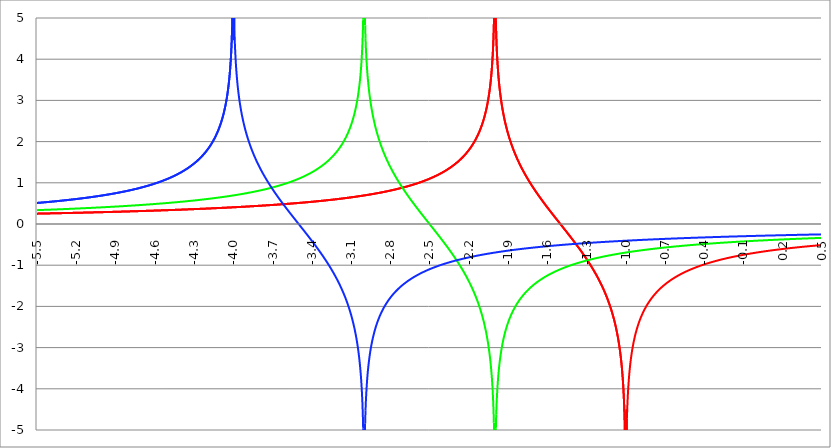
| Category | Series 1 | Series 0 | Series 2 |
|---|---|---|---|
| -5.5 | 0.251 | 0.336 | 0.511 |
| -5.497 | 0.252 | 0.337 | 0.512 |
| -5.494 | 0.252 | 0.337 | 0.512 |
| -5.491 | 0.252 | 0.338 | 0.513 |
| -5.488 | 0.252 | 0.338 | 0.514 |
| -5.484999999999999 | 0.252 | 0.338 | 0.515 |
| -5.482 | 0.252 | 0.339 | 0.516 |
| -5.479 | 0.253 | 0.339 | 0.516 |
| -5.476 | 0.253 | 0.339 | 0.517 |
| -5.472999999999999 | 0.253 | 0.34 | 0.518 |
| -5.469999999999999 | 0.253 | 0.34 | 0.519 |
| -5.466999999999999 | 0.253 | 0.34 | 0.52 |
| -5.463999999999999 | 0.254 | 0.341 | 0.521 |
| -5.460999999999998 | 0.254 | 0.341 | 0.521 |
| -5.457999999999998 | 0.254 | 0.341 | 0.522 |
| -5.454999999999998 | 0.254 | 0.342 | 0.523 |
| -5.451999999999998 | 0.254 | 0.342 | 0.524 |
| -5.448999999999998 | 0.255 | 0.342 | 0.525 |
| -5.445999999999998 | 0.255 | 0.343 | 0.526 |
| -5.442999999999998 | 0.255 | 0.343 | 0.527 |
| -5.439999999999997 | 0.255 | 0.343 | 0.527 |
| -5.436999999999997 | 0.255 | 0.344 | 0.528 |
| -5.433999999999997 | 0.256 | 0.344 | 0.529 |
| -5.430999999999997 | 0.256 | 0.345 | 0.53 |
| -5.427999999999997 | 0.256 | 0.345 | 0.531 |
| -5.424999999999997 | 0.256 | 0.345 | 0.532 |
| -5.421999999999997 | 0.256 | 0.346 | 0.533 |
| -5.418999999999997 | 0.257 | 0.346 | 0.533 |
| -5.415999999999997 | 0.257 | 0.346 | 0.534 |
| -5.412999999999997 | 0.257 | 0.347 | 0.535 |
| -5.409999999999996 | 0.257 | 0.347 | 0.536 |
| -5.406999999999996 | 0.257 | 0.347 | 0.537 |
| -5.403999999999996 | 0.258 | 0.348 | 0.538 |
| -5.400999999999996 | 0.258 | 0.348 | 0.539 |
| -5.397999999999996 | 0.258 | 0.349 | 0.54 |
| -5.394999999999996 | 0.258 | 0.349 | 0.54 |
| -5.391999999999996 | 0.258 | 0.349 | 0.541 |
| -5.388999999999996 | 0.259 | 0.35 | 0.542 |
| -5.385999999999996 | 0.259 | 0.35 | 0.543 |
| -5.382999999999996 | 0.259 | 0.35 | 0.544 |
| -5.379999999999995 | 0.259 | 0.351 | 0.545 |
| -5.376999999999995 | 0.259 | 0.351 | 0.546 |
| -5.373999999999995 | 0.26 | 0.352 | 0.547 |
| -5.370999999999995 | 0.26 | 0.352 | 0.548 |
| -5.367999999999995 | 0.26 | 0.352 | 0.549 |
| -5.364999999999995 | 0.26 | 0.353 | 0.55 |
| -5.361999999999995 | 0.26 | 0.353 | 0.551 |
| -5.358999999999995 | 0.261 | 0.353 | 0.551 |
| -5.355999999999994 | 0.261 | 0.354 | 0.552 |
| -5.352999999999994 | 0.261 | 0.354 | 0.553 |
| -5.349999999999994 | 0.261 | 0.355 | 0.554 |
| -5.346999999999994 | 0.261 | 0.355 | 0.555 |
| -5.343999999999994 | 0.262 | 0.355 | 0.556 |
| -5.340999999999994 | 0.262 | 0.356 | 0.557 |
| -5.337999999999994 | 0.262 | 0.356 | 0.558 |
| -5.334999999999994 | 0.262 | 0.356 | 0.559 |
| -5.331999999999994 | 0.262 | 0.357 | 0.56 |
| -5.328999999999993 | 0.263 | 0.357 | 0.561 |
| -5.325999999999993 | 0.263 | 0.358 | 0.562 |
| -5.322999999999993 | 0.263 | 0.358 | 0.563 |
| -5.319999999999993 | 0.263 | 0.358 | 0.564 |
| -5.316999999999993 | 0.263 | 0.359 | 0.565 |
| -5.313999999999993 | 0.264 | 0.359 | 0.566 |
| -5.310999999999993 | 0.264 | 0.36 | 0.567 |
| -5.307999999999993 | 0.264 | 0.36 | 0.568 |
| -5.304999999999993 | 0.264 | 0.36 | 0.569 |
| -5.301999999999992 | 0.265 | 0.361 | 0.57 |
| -5.298999999999992 | 0.265 | 0.361 | 0.571 |
| -5.295999999999992 | 0.265 | 0.362 | 0.572 |
| -5.292999999999992 | 0.265 | 0.362 | 0.573 |
| -5.289999999999992 | 0.265 | 0.362 | 0.574 |
| -5.286999999999992 | 0.266 | 0.363 | 0.575 |
| -5.283999999999992 | 0.266 | 0.363 | 0.576 |
| -5.280999999999992 | 0.266 | 0.364 | 0.577 |
| -5.277999999999992 | 0.266 | 0.364 | 0.578 |
| -5.274999999999991 | 0.266 | 0.364 | 0.579 |
| -5.271999999999991 | 0.267 | 0.365 | 0.58 |
| -5.268999999999991 | 0.267 | 0.365 | 0.581 |
| -5.265999999999991 | 0.267 | 0.366 | 0.582 |
| -5.262999999999991 | 0.267 | 0.366 | 0.583 |
| -5.259999999999991 | 0.268 | 0.366 | 0.584 |
| -5.256999999999991 | 0.268 | 0.367 | 0.585 |
| -5.253999999999991 | 0.268 | 0.367 | 0.586 |
| -5.250999999999991 | 0.268 | 0.368 | 0.587 |
| -5.24799999999999 | 0.268 | 0.368 | 0.588 |
| -5.24499999999999 | 0.269 | 0.368 | 0.59 |
| -5.24199999999999 | 0.269 | 0.369 | 0.591 |
| -5.23899999999999 | 0.269 | 0.369 | 0.592 |
| -5.23599999999999 | 0.269 | 0.37 | 0.593 |
| -5.23299999999999 | 0.27 | 0.37 | 0.594 |
| -5.22999999999999 | 0.27 | 0.37 | 0.595 |
| -5.22699999999999 | 0.27 | 0.371 | 0.596 |
| -5.22399999999999 | 0.27 | 0.371 | 0.597 |
| -5.220999999999989 | 0.27 | 0.372 | 0.598 |
| -5.217999999999989 | 0.271 | 0.372 | 0.599 |
| -5.214999999999989 | 0.271 | 0.373 | 0.601 |
| -5.21199999999999 | 0.271 | 0.373 | 0.602 |
| -5.208999999999989 | 0.271 | 0.373 | 0.603 |
| -5.205999999999989 | 0.271 | 0.374 | 0.604 |
| -5.202999999999989 | 0.272 | 0.374 | 0.605 |
| -5.199999999999989 | 0.272 | 0.375 | 0.606 |
| -5.196999999999988 | 0.272 | 0.375 | 0.607 |
| -5.193999999999988 | 0.272 | 0.376 | 0.608 |
| -5.190999999999988 | 0.273 | 0.376 | 0.61 |
| -5.187999999999988 | 0.273 | 0.376 | 0.611 |
| -5.184999999999988 | 0.273 | 0.377 | 0.612 |
| -5.181999999999988 | 0.273 | 0.377 | 0.613 |
| -5.178999999999988 | 0.274 | 0.378 | 0.614 |
| -5.175999999999988 | 0.274 | 0.378 | 0.615 |
| -5.172999999999988 | 0.274 | 0.379 | 0.617 |
| -5.169999999999987 | 0.274 | 0.379 | 0.618 |
| -5.166999999999987 | 0.274 | 0.379 | 0.619 |
| -5.163999999999987 | 0.275 | 0.38 | 0.62 |
| -5.160999999999987 | 0.275 | 0.38 | 0.621 |
| -5.157999999999987 | 0.275 | 0.381 | 0.622 |
| -5.154999999999987 | 0.275 | 0.381 | 0.624 |
| -5.151999999999987 | 0.276 | 0.382 | 0.625 |
| -5.148999999999987 | 0.276 | 0.382 | 0.626 |
| -5.145999999999987 | 0.276 | 0.383 | 0.627 |
| -5.142999999999986 | 0.276 | 0.383 | 0.629 |
| -5.139999999999986 | 0.276 | 0.383 | 0.63 |
| -5.136999999999986 | 0.277 | 0.384 | 0.631 |
| -5.133999999999986 | 0.277 | 0.384 | 0.632 |
| -5.130999999999986 | 0.277 | 0.385 | 0.633 |
| -5.127999999999986 | 0.277 | 0.385 | 0.635 |
| -5.124999999999986 | 0.278 | 0.386 | 0.636 |
| -5.121999999999986 | 0.278 | 0.386 | 0.637 |
| -5.118999999999986 | 0.278 | 0.387 | 0.639 |
| -5.115999999999985 | 0.278 | 0.387 | 0.64 |
| -5.112999999999985 | 0.279 | 0.387 | 0.641 |
| -5.109999999999985 | 0.279 | 0.388 | 0.642 |
| -5.106999999999985 | 0.279 | 0.388 | 0.644 |
| -5.103999999999985 | 0.279 | 0.389 | 0.645 |
| -5.100999999999985 | 0.28 | 0.389 | 0.646 |
| -5.097999999999985 | 0.28 | 0.39 | 0.647 |
| -5.094999999999985 | 0.28 | 0.39 | 0.649 |
| -5.091999999999984 | 0.28 | 0.391 | 0.65 |
| -5.088999999999984 | 0.28 | 0.391 | 0.651 |
| -5.085999999999984 | 0.281 | 0.392 | 0.653 |
| -5.082999999999984 | 0.281 | 0.392 | 0.654 |
| -5.079999999999984 | 0.281 | 0.393 | 0.655 |
| -5.076999999999984 | 0.281 | 0.393 | 0.657 |
| -5.073999999999984 | 0.282 | 0.394 | 0.658 |
| -5.070999999999984 | 0.282 | 0.394 | 0.659 |
| -5.067999999999984 | 0.282 | 0.394 | 0.661 |
| -5.064999999999984 | 0.282 | 0.395 | 0.662 |
| -5.061999999999983 | 0.283 | 0.395 | 0.664 |
| -5.058999999999983 | 0.283 | 0.396 | 0.665 |
| -5.055999999999983 | 0.283 | 0.396 | 0.666 |
| -5.052999999999983 | 0.283 | 0.397 | 0.668 |
| -5.049999999999983 | 0.284 | 0.397 | 0.669 |
| -5.046999999999983 | 0.284 | 0.398 | 0.67 |
| -5.043999999999983 | 0.284 | 0.398 | 0.672 |
| -5.040999999999983 | 0.284 | 0.399 | 0.673 |
| -5.037999999999982 | 0.285 | 0.399 | 0.675 |
| -5.034999999999982 | 0.285 | 0.4 | 0.676 |
| -5.031999999999982 | 0.285 | 0.4 | 0.678 |
| -5.028999999999982 | 0.285 | 0.401 | 0.679 |
| -5.025999999999982 | 0.286 | 0.401 | 0.68 |
| -5.022999999999982 | 0.286 | 0.402 | 0.682 |
| -5.019999999999982 | 0.286 | 0.402 | 0.683 |
| -5.016999999999982 | 0.286 | 0.403 | 0.685 |
| -5.013999999999982 | 0.287 | 0.403 | 0.686 |
| -5.010999999999981 | 0.287 | 0.404 | 0.688 |
| -5.007999999999981 | 0.287 | 0.404 | 0.689 |
| -5.004999999999981 | 0.287 | 0.405 | 0.691 |
| -5.001999999999981 | 0.288 | 0.405 | 0.692 |
| -4.998999999999981 | 0.288 | 0.406 | 0.694 |
| -4.995999999999981 | 0.288 | 0.406 | 0.695 |
| -4.992999999999981 | 0.288 | 0.407 | 0.697 |
| -4.98999999999998 | 0.289 | 0.407 | 0.698 |
| -4.98699999999998 | 0.289 | 0.408 | 0.7 |
| -4.98399999999998 | 0.289 | 0.408 | 0.701 |
| -4.98099999999998 | 0.289 | 0.409 | 0.703 |
| -4.97799999999998 | 0.29 | 0.409 | 0.704 |
| -4.97499999999998 | 0.29 | 0.41 | 0.706 |
| -4.97199999999998 | 0.29 | 0.41 | 0.707 |
| -4.96899999999998 | 0.29 | 0.411 | 0.709 |
| -4.96599999999998 | 0.291 | 0.411 | 0.711 |
| -4.96299999999998 | 0.291 | 0.412 | 0.712 |
| -4.95999999999998 | 0.291 | 0.412 | 0.714 |
| -4.95699999999998 | 0.291 | 0.413 | 0.715 |
| -4.95399999999998 | 0.292 | 0.413 | 0.717 |
| -4.95099999999998 | 0.292 | 0.414 | 0.719 |
| -4.94799999999998 | 0.292 | 0.414 | 0.72 |
| -4.944999999999979 | 0.292 | 0.415 | 0.722 |
| -4.941999999999978 | 0.293 | 0.415 | 0.723 |
| -4.938999999999978 | 0.293 | 0.416 | 0.725 |
| -4.935999999999978 | 0.293 | 0.416 | 0.727 |
| -4.932999999999978 | 0.293 | 0.417 | 0.728 |
| -4.929999999999978 | 0.294 | 0.417 | 0.73 |
| -4.926999999999978 | 0.294 | 0.418 | 0.732 |
| -4.923999999999978 | 0.294 | 0.419 | 0.733 |
| -4.920999999999978 | 0.294 | 0.419 | 0.735 |
| -4.917999999999978 | 0.295 | 0.42 | 0.737 |
| -4.914999999999978 | 0.295 | 0.42 | 0.739 |
| -4.911999999999977 | 0.295 | 0.421 | 0.74 |
| -4.908999999999977 | 0.295 | 0.421 | 0.742 |
| -4.905999999999977 | 0.296 | 0.422 | 0.744 |
| -4.902999999999977 | 0.296 | 0.422 | 0.745 |
| -4.899999999999977 | 0.296 | 0.423 | 0.747 |
| -4.896999999999977 | 0.297 | 0.423 | 0.749 |
| -4.893999999999977 | 0.297 | 0.424 | 0.751 |
| -4.890999999999977 | 0.297 | 0.424 | 0.753 |
| -4.887999999999977 | 0.297 | 0.425 | 0.754 |
| -4.884999999999977 | 0.298 | 0.426 | 0.756 |
| -4.881999999999976 | 0.298 | 0.426 | 0.758 |
| -4.878999999999976 | 0.298 | 0.427 | 0.76 |
| -4.875999999999976 | 0.298 | 0.427 | 0.762 |
| -4.872999999999976 | 0.299 | 0.428 | 0.763 |
| -4.869999999999976 | 0.299 | 0.428 | 0.765 |
| -4.866999999999976 | 0.299 | 0.429 | 0.767 |
| -4.863999999999976 | 0.299 | 0.429 | 0.769 |
| -4.860999999999976 | 0.3 | 0.43 | 0.771 |
| -4.857999999999976 | 0.3 | 0.431 | 0.773 |
| -4.854999999999976 | 0.3 | 0.431 | 0.775 |
| -4.851999999999975 | 0.301 | 0.432 | 0.776 |
| -4.848999999999975 | 0.301 | 0.432 | 0.778 |
| -4.845999999999975 | 0.301 | 0.433 | 0.78 |
| -4.842999999999975 | 0.301 | 0.433 | 0.782 |
| -4.839999999999974 | 0.302 | 0.434 | 0.784 |
| -4.836999999999974 | 0.302 | 0.435 | 0.786 |
| -4.833999999999974 | 0.302 | 0.435 | 0.788 |
| -4.830999999999974 | 0.302 | 0.436 | 0.79 |
| -4.827999999999974 | 0.303 | 0.436 | 0.792 |
| -4.824999999999974 | 0.303 | 0.437 | 0.794 |
| -4.821999999999974 | 0.303 | 0.438 | 0.796 |
| -4.818999999999974 | 0.304 | 0.438 | 0.798 |
| -4.815999999999974 | 0.304 | 0.439 | 0.8 |
| -4.812999999999974 | 0.304 | 0.439 | 0.802 |
| -4.809999999999974 | 0.304 | 0.44 | 0.804 |
| -4.806999999999974 | 0.305 | 0.44 | 0.806 |
| -4.803999999999974 | 0.305 | 0.441 | 0.808 |
| -4.800999999999973 | 0.305 | 0.442 | 0.81 |
| -4.797999999999973 | 0.306 | 0.442 | 0.812 |
| -4.794999999999973 | 0.306 | 0.443 | 0.814 |
| -4.791999999999973 | 0.306 | 0.443 | 0.817 |
| -4.788999999999973 | 0.306 | 0.444 | 0.819 |
| -4.785999999999973 | 0.307 | 0.445 | 0.821 |
| -4.782999999999973 | 0.307 | 0.445 | 0.823 |
| -4.779999999999972 | 0.307 | 0.446 | 0.825 |
| -4.776999999999972 | 0.308 | 0.446 | 0.827 |
| -4.773999999999972 | 0.308 | 0.447 | 0.829 |
| -4.770999999999972 | 0.308 | 0.448 | 0.832 |
| -4.767999999999972 | 0.308 | 0.448 | 0.834 |
| -4.764999999999972 | 0.309 | 0.449 | 0.836 |
| -4.761999999999972 | 0.309 | 0.45 | 0.838 |
| -4.758999999999972 | 0.309 | 0.45 | 0.84 |
| -4.755999999999972 | 0.31 | 0.451 | 0.843 |
| -4.752999999999972 | 0.31 | 0.451 | 0.845 |
| -4.749999999999971 | 0.31 | 0.452 | 0.847 |
| -4.746999999999971 | 0.31 | 0.453 | 0.85 |
| -4.743999999999971 | 0.311 | 0.453 | 0.852 |
| -4.740999999999971 | 0.311 | 0.454 | 0.854 |
| -4.737999999999971 | 0.311 | 0.454 | 0.857 |
| -4.734999999999971 | 0.312 | 0.455 | 0.859 |
| -4.73199999999997 | 0.312 | 0.456 | 0.861 |
| -4.728999999999971 | 0.312 | 0.456 | 0.864 |
| -4.725999999999971 | 0.312 | 0.457 | 0.866 |
| -4.72299999999997 | 0.313 | 0.458 | 0.868 |
| -4.71999999999997 | 0.313 | 0.458 | 0.871 |
| -4.71699999999997 | 0.313 | 0.459 | 0.873 |
| -4.71399999999997 | 0.314 | 0.46 | 0.876 |
| -4.71099999999997 | 0.314 | 0.46 | 0.878 |
| -4.70799999999997 | 0.314 | 0.461 | 0.881 |
| -4.70499999999997 | 0.315 | 0.462 | 0.883 |
| -4.70199999999997 | 0.315 | 0.462 | 0.886 |
| -4.69899999999997 | 0.315 | 0.463 | 0.888 |
| -4.695999999999969 | 0.315 | 0.463 | 0.891 |
| -4.692999999999969 | 0.316 | 0.464 | 0.893 |
| -4.68999999999997 | 0.316 | 0.465 | 0.896 |
| -4.68699999999997 | 0.316 | 0.465 | 0.898 |
| -4.683999999999969 | 0.317 | 0.466 | 0.901 |
| -4.680999999999969 | 0.317 | 0.467 | 0.904 |
| -4.677999999999969 | 0.317 | 0.467 | 0.906 |
| -4.674999999999969 | 0.318 | 0.468 | 0.909 |
| -4.671999999999968 | 0.318 | 0.469 | 0.912 |
| -4.668999999999968 | 0.318 | 0.469 | 0.914 |
| -4.665999999999968 | 0.319 | 0.47 | 0.917 |
| -4.662999999999968 | 0.319 | 0.471 | 0.92 |
| -4.659999999999968 | 0.319 | 0.472 | 0.922 |
| -4.656999999999968 | 0.319 | 0.472 | 0.925 |
| -4.653999999999968 | 0.32 | 0.473 | 0.928 |
| -4.650999999999968 | 0.32 | 0.474 | 0.931 |
| -4.647999999999968 | 0.32 | 0.474 | 0.933 |
| -4.644999999999968 | 0.321 | 0.475 | 0.936 |
| -4.641999999999967 | 0.321 | 0.476 | 0.939 |
| -4.638999999999967 | 0.321 | 0.476 | 0.942 |
| -4.635999999999967 | 0.322 | 0.477 | 0.945 |
| -4.632999999999967 | 0.322 | 0.478 | 0.948 |
| -4.629999999999967 | 0.322 | 0.478 | 0.951 |
| -4.626999999999967 | 0.323 | 0.479 | 0.954 |
| -4.623999999999967 | 0.323 | 0.48 | 0.956 |
| -4.620999999999967 | 0.323 | 0.481 | 0.959 |
| -4.617999999999966 | 0.324 | 0.481 | 0.962 |
| -4.614999999999966 | 0.324 | 0.482 | 0.965 |
| -4.611999999999966 | 0.324 | 0.483 | 0.968 |
| -4.608999999999966 | 0.324 | 0.483 | 0.972 |
| -4.605999999999966 | 0.325 | 0.484 | 0.975 |
| -4.602999999999966 | 0.325 | 0.485 | 0.978 |
| -4.599999999999965 | 0.325 | 0.486 | 0.981 |
| -4.596999999999965 | 0.326 | 0.486 | 0.984 |
| -4.593999999999965 | 0.326 | 0.487 | 0.987 |
| -4.590999999999965 | 0.326 | 0.488 | 0.99 |
| -4.587999999999965 | 0.327 | 0.488 | 0.994 |
| -4.584999999999965 | 0.327 | 0.489 | 0.997 |
| -4.581999999999965 | 0.327 | 0.49 | 1 |
| -4.578999999999965 | 0.328 | 0.491 | 1.003 |
| -4.575999999999964 | 0.328 | 0.491 | 1.007 |
| -4.572999999999964 | 0.328 | 0.492 | 1.01 |
| -4.569999999999964 | 0.329 | 0.493 | 1.013 |
| -4.566999999999964 | 0.329 | 0.494 | 1.017 |
| -4.563999999999964 | 0.329 | 0.494 | 1.02 |
| -4.560999999999964 | 0.33 | 0.495 | 1.023 |
| -4.557999999999964 | 0.33 | 0.496 | 1.027 |
| -4.554999999999964 | 0.33 | 0.497 | 1.03 |
| -4.551999999999964 | 0.331 | 0.497 | 1.034 |
| -4.548999999999964 | 0.331 | 0.498 | 1.037 |
| -4.545999999999964 | 0.331 | 0.499 | 1.041 |
| -4.542999999999964 | 0.332 | 0.5 | 1.044 |
| -4.539999999999963 | 0.332 | 0.5 | 1.048 |
| -4.536999999999963 | 0.332 | 0.501 | 1.052 |
| -4.533999999999963 | 0.333 | 0.502 | 1.055 |
| -4.530999999999963 | 0.333 | 0.503 | 1.059 |
| -4.527999999999963 | 0.333 | 0.503 | 1.063 |
| -4.524999999999963 | 0.334 | 0.504 | 1.066 |
| -4.521999999999963 | 0.334 | 0.505 | 1.07 |
| -4.518999999999963 | 0.334 | 0.506 | 1.074 |
| -4.515999999999963 | 0.335 | 0.507 | 1.078 |
| -4.512999999999963 | 0.335 | 0.507 | 1.082 |
| -4.509999999999962 | 0.335 | 0.508 | 1.085 |
| -4.506999999999962 | 0.336 | 0.509 | 1.089 |
| -4.503999999999962 | 0.336 | 0.51 | 1.093 |
| -4.500999999999962 | 0.336 | 0.511 | 1.097 |
| -4.497999999999962 | 0.337 | 0.511 | 1.101 |
| -4.494999999999962 | 0.337 | 0.512 | 1.105 |
| -4.491999999999961 | 0.337 | 0.513 | 1.109 |
| -4.488999999999961 | 0.338 | 0.514 | 1.113 |
| -4.485999999999961 | 0.338 | 0.515 | 1.118 |
| -4.482999999999961 | 0.338 | 0.515 | 1.122 |
| -4.47999999999996 | 0.339 | 0.516 | 1.126 |
| -4.47699999999996 | 0.339 | 0.517 | 1.13 |
| -4.47399999999996 | 0.339 | 0.518 | 1.135 |
| -4.47099999999996 | 0.34 | 0.519 | 1.139 |
| -4.467999999999961 | 0.34 | 0.52 | 1.143 |
| -4.464999999999961 | 0.341 | 0.52 | 1.148 |
| -4.46199999999996 | 0.341 | 0.521 | 1.152 |
| -4.45899999999996 | 0.341 | 0.522 | 1.156 |
| -4.45599999999996 | 0.342 | 0.523 | 1.161 |
| -4.45299999999996 | 0.342 | 0.524 | 1.165 |
| -4.44999999999996 | 0.342 | 0.525 | 1.17 |
| -4.44699999999996 | 0.343 | 0.525 | 1.175 |
| -4.44399999999996 | 0.343 | 0.526 | 1.179 |
| -4.44099999999996 | 0.343 | 0.527 | 1.184 |
| -4.43799999999996 | 0.344 | 0.528 | 1.189 |
| -4.43499999999996 | 0.344 | 0.529 | 1.194 |
| -4.43199999999996 | 0.344 | 0.53 | 1.198 |
| -4.428999999999959 | 0.345 | 0.531 | 1.203 |
| -4.425999999999959 | 0.345 | 0.531 | 1.208 |
| -4.422999999999959 | 0.346 | 0.532 | 1.213 |
| -4.41999999999996 | 0.346 | 0.533 | 1.218 |
| -4.416999999999959 | 0.346 | 0.534 | 1.223 |
| -4.413999999999959 | 0.347 | 0.535 | 1.228 |
| -4.410999999999959 | 0.347 | 0.536 | 1.233 |
| -4.407999999999959 | 0.347 | 0.537 | 1.239 |
| -4.404999999999958 | 0.348 | 0.538 | 1.244 |
| -4.401999999999958 | 0.348 | 0.538 | 1.249 |
| -4.398999999999958 | 0.348 | 0.539 | 1.255 |
| -4.395999999999958 | 0.349 | 0.54 | 1.26 |
| -4.392999999999958 | 0.349 | 0.541 | 1.265 |
| -4.389999999999958 | 0.35 | 0.542 | 1.271 |
| -4.386999999999958 | 0.35 | 0.543 | 1.276 |
| -4.383999999999958 | 0.35 | 0.544 | 1.282 |
| -4.380999999999958 | 0.351 | 0.545 | 1.288 |
| -4.377999999999957 | 0.351 | 0.546 | 1.293 |
| -4.374999999999957 | 0.351 | 0.547 | 1.299 |
| -4.371999999999957 | 0.352 | 0.547 | 1.305 |
| -4.368999999999957 | 0.352 | 0.548 | 1.311 |
| -4.365999999999957 | 0.353 | 0.549 | 1.317 |
| -4.362999999999957 | 0.353 | 0.55 | 1.323 |
| -4.359999999999957 | 0.353 | 0.551 | 1.329 |
| -4.356999999999957 | 0.354 | 0.552 | 1.335 |
| -4.353999999999957 | 0.354 | 0.553 | 1.342 |
| -4.350999999999956 | 0.354 | 0.554 | 1.348 |
| -4.347999999999956 | 0.355 | 0.555 | 1.354 |
| -4.344999999999956 | 0.355 | 0.556 | 1.361 |
| -4.341999999999956 | 0.356 | 0.557 | 1.367 |
| -4.338999999999956 | 0.356 | 0.558 | 1.374 |
| -4.335999999999956 | 0.356 | 0.559 | 1.38 |
| -4.332999999999956 | 0.357 | 0.56 | 1.387 |
| -4.329999999999956 | 0.357 | 0.561 | 1.394 |
| -4.326999999999955 | 0.357 | 0.562 | 1.401 |
| -4.323999999999955 | 0.358 | 0.563 | 1.408 |
| -4.320999999999955 | 0.358 | 0.564 | 1.415 |
| -4.317999999999955 | 0.359 | 0.565 | 1.422 |
| -4.314999999999955 | 0.359 | 0.566 | 1.429 |
| -4.311999999999955 | 0.359 | 0.567 | 1.436 |
| -4.308999999999955 | 0.36 | 0.568 | 1.444 |
| -4.305999999999955 | 0.36 | 0.569 | 1.451 |
| -4.302999999999955 | 0.361 | 0.57 | 1.459 |
| -4.299999999999954 | 0.361 | 0.571 | 1.466 |
| -4.296999999999954 | 0.361 | 0.572 | 1.474 |
| -4.293999999999954 | 0.362 | 0.573 | 1.482 |
| -4.290999999999954 | 0.362 | 0.574 | 1.49 |
| -4.287999999999954 | 0.363 | 0.575 | 1.498 |
| -4.284999999999954 | 0.363 | 0.576 | 1.506 |
| -4.281999999999954 | 0.363 | 0.577 | 1.514 |
| -4.278999999999954 | 0.364 | 0.578 | 1.523 |
| -4.275999999999954 | 0.364 | 0.579 | 1.531 |
| -4.272999999999953 | 0.365 | 0.58 | 1.54 |
| -4.269999999999953 | 0.365 | 0.581 | 1.548 |
| -4.266999999999953 | 0.365 | 0.582 | 1.557 |
| -4.263999999999953 | 0.366 | 0.583 | 1.566 |
| -4.260999999999953 | 0.366 | 0.584 | 1.575 |
| -4.257999999999953 | 0.367 | 0.585 | 1.584 |
| -4.254999999999953 | 0.367 | 0.586 | 1.594 |
| -4.251999999999953 | 0.367 | 0.587 | 1.603 |
| -4.248999999999953 | 0.368 | 0.588 | 1.613 |
| -4.245999999999952 | 0.368 | 0.589 | 1.622 |
| -4.242999999999952 | 0.369 | 0.59 | 1.632 |
| -4.239999999999952 | 0.369 | 0.591 | 1.642 |
| -4.236999999999952 | 0.37 | 0.592 | 1.652 |
| -4.233999999999952 | 0.37 | 0.594 | 1.663 |
| -4.230999999999952 | 0.37 | 0.595 | 1.673 |
| -4.227999999999952 | 0.371 | 0.596 | 1.684 |
| -4.224999999999952 | 0.371 | 0.597 | 1.695 |
| -4.221999999999952 | 0.372 | 0.598 | 1.706 |
| -4.218999999999951 | 0.372 | 0.599 | 1.717 |
| -4.215999999999951 | 0.372 | 0.6 | 1.728 |
| -4.212999999999951 | 0.373 | 0.601 | 1.74 |
| -4.209999999999951 | 0.373 | 0.602 | 1.751 |
| -4.206999999999951 | 0.374 | 0.603 | 1.763 |
| -4.203999999999951 | 0.374 | 0.605 | 1.775 |
| -4.200999999999951 | 0.375 | 0.606 | 1.788 |
| -4.197999999999951 | 0.375 | 0.607 | 1.8 |
| -4.194999999999951 | 0.375 | 0.608 | 1.813 |
| -4.19199999999995 | 0.376 | 0.609 | 1.826 |
| -4.18899999999995 | 0.376 | 0.61 | 1.839 |
| -4.18599999999995 | 0.377 | 0.611 | 1.853 |
| -4.18299999999995 | 0.377 | 0.613 | 1.866 |
| -4.17999999999995 | 0.378 | 0.614 | 1.88 |
| -4.17699999999995 | 0.378 | 0.615 | 1.895 |
| -4.17399999999995 | 0.378 | 0.616 | 1.909 |
| -4.17099999999995 | 0.379 | 0.617 | 1.924 |
| -4.16799999999995 | 0.379 | 0.619 | 1.939 |
| -4.164999999999949 | 0.38 | 0.62 | 1.955 |
| -4.161999999999949 | 0.38 | 0.621 | 1.97 |
| -4.158999999999949 | 0.381 | 0.622 | 1.986 |
| -4.155999999999949 | 0.381 | 0.623 | 2.003 |
| -4.152999999999949 | 0.381 | 0.624 | 2.02 |
| -4.149999999999949 | 0.382 | 0.626 | 2.037 |
| -4.146999999999949 | 0.382 | 0.627 | 2.054 |
| -4.143999999999949 | 0.383 | 0.628 | 2.072 |
| -4.140999999999948 | 0.383 | 0.629 | 2.091 |
| -4.137999999999948 | 0.384 | 0.631 | 2.11 |
| -4.134999999999948 | 0.384 | 0.632 | 2.129 |
| -4.131999999999948 | 0.385 | 0.633 | 2.149 |
| -4.128999999999948 | 0.385 | 0.634 | 2.169 |
| -4.125999999999948 | 0.386 | 0.636 | 2.19 |
| -4.122999999999948 | 0.386 | 0.637 | 2.212 |
| -4.119999999999948 | 0.386 | 0.638 | 2.234 |
| -4.116999999999948 | 0.387 | 0.639 | 2.256 |
| -4.113999999999947 | 0.387 | 0.641 | 2.28 |
| -4.110999999999947 | 0.388 | 0.642 | 2.303 |
| -4.107999999999947 | 0.388 | 0.643 | 2.328 |
| -4.104999999999947 | 0.389 | 0.644 | 2.354 |
| -4.101999999999947 | 0.389 | 0.646 | 2.38 |
| -4.098999999999947 | 0.39 | 0.647 | 2.407 |
| -4.095999999999947 | 0.39 | 0.648 | 2.435 |
| -4.092999999999947 | 0.391 | 0.65 | 2.464 |
| -4.089999999999946 | 0.391 | 0.651 | 2.494 |
| -4.086999999999946 | 0.391 | 0.652 | 2.525 |
| -4.083999999999946 | 0.392 | 0.654 | 2.558 |
| -4.080999999999946 | 0.392 | 0.655 | 2.591 |
| -4.077999999999946 | 0.393 | 0.656 | 2.626 |
| -4.074999999999946 | 0.393 | 0.658 | 2.663 |
| -4.071999999999945 | 0.394 | 0.659 | 2.701 |
| -4.068999999999946 | 0.394 | 0.66 | 2.74 |
| -4.065999999999946 | 0.395 | 0.662 | 2.782 |
| -4.062999999999946 | 0.395 | 0.663 | 2.826 |
| -4.059999999999945 | 0.396 | 0.664 | 2.872 |
| -4.056999999999945 | 0.396 | 0.666 | 2.92 |
| -4.053999999999945 | 0.397 | 0.667 | 2.971 |
| -4.050999999999945 | 0.397 | 0.669 | 3.026 |
| -4.047999999999945 | 0.398 | 0.67 | 3.083 |
| -4.044999999999945 | 0.398 | 0.671 | 3.145 |
| -4.041999999999944 | 0.399 | 0.673 | 3.211 |
| -4.038999999999944 | 0.399 | 0.674 | 3.282 |
| -4.035999999999944 | 0.4 | 0.676 | 3.36 |
| -4.032999999999944 | 0.4 | 0.677 | 3.444 |
| -4.029999999999944 | 0.401 | 0.678 | 3.536 |
| -4.026999999999944 | 0.401 | 0.68 | 3.639 |
| -4.023999999999944 | 0.402 | 0.681 | 3.753 |
| -4.020999999999944 | 0.402 | 0.683 | 3.884 |
| -4.017999999999944 | 0.402 | 0.684 | 4.035 |
| -4.014999999999944 | 0.403 | 0.686 | 4.215 |
| -4.011999999999944 | 0.403 | 0.687 | 4.435 |
| -4.008999999999943 | 0.404 | 0.689 | 4.719 |
| -4.005999999999943 | 0.404 | 0.69 | 5.122 |
| -4.002999999999943 | 0.405 | 0.692 | 5.812 |
| -3.999999999999943 | 0.405 | 0.693 | 30.498 |
| -3.996999999999943 | 0.406 | 0.695 | 5.806 |
| -3.993999999999943 | 0.406 | 0.696 | 5.11 |
| -3.990999999999943 | 0.407 | 0.698 | 4.701 |
| -3.987999999999943 | 0.407 | 0.699 | 4.411 |
| -3.984999999999943 | 0.408 | 0.701 | 4.185 |
| -3.981999999999942 | 0.408 | 0.702 | 3.999 |
| -3.978999999999942 | 0.409 | 0.704 | 3.842 |
| -3.975999999999942 | 0.41 | 0.705 | 3.705 |
| -3.972999999999942 | 0.41 | 0.707 | 3.585 |
| -3.969999999999942 | 0.411 | 0.708 | 3.476 |
| -3.966999999999942 | 0.411 | 0.71 | 3.378 |
| -3.963999999999942 | 0.412 | 0.712 | 3.288 |
| -3.960999999999942 | 0.412 | 0.713 | 3.204 |
| -3.957999999999942 | 0.413 | 0.715 | 3.127 |
| -3.954999999999941 | 0.413 | 0.716 | 3.055 |
| -3.951999999999941 | 0.414 | 0.718 | 2.987 |
| -3.948999999999941 | 0.414 | 0.72 | 2.924 |
| -3.945999999999941 | 0.415 | 0.721 | 2.863 |
| -3.942999999999941 | 0.415 | 0.723 | 2.806 |
| -3.939999999999941 | 0.416 | 0.725 | 2.752 |
| -3.936999999999941 | 0.416 | 0.726 | 2.7 |
| -3.933999999999941 | 0.417 | 0.728 | 2.65 |
| -3.930999999999941 | 0.417 | 0.73 | 2.602 |
| -3.92799999999994 | 0.418 | 0.731 | 2.556 |
| -3.92499999999994 | 0.418 | 0.733 | 2.512 |
| -3.92199999999994 | 0.419 | 0.735 | 2.47 |
| -3.91899999999994 | 0.419 | 0.736 | 2.429 |
| -3.91599999999994 | 0.42 | 0.738 | 2.389 |
| -3.91299999999994 | 0.421 | 0.74 | 2.351 |
| -3.90999999999994 | 0.421 | 0.741 | 2.314 |
| -3.90699999999994 | 0.422 | 0.743 | 2.278 |
| -3.903999999999939 | 0.422 | 0.745 | 2.242 |
| -3.900999999999939 | 0.423 | 0.747 | 2.208 |
| -3.897999999999939 | 0.423 | 0.748 | 2.175 |
| -3.894999999999939 | 0.424 | 0.75 | 2.143 |
| -3.891999999999939 | 0.424 | 0.752 | 2.111 |
| -3.888999999999939 | 0.425 | 0.754 | 2.081 |
| -3.885999999999939 | 0.425 | 0.755 | 2.051 |
| -3.882999999999939 | 0.426 | 0.757 | 2.021 |
| -3.879999999999939 | 0.427 | 0.759 | 1.992 |
| -3.876999999999938 | 0.427 | 0.761 | 1.964 |
| -3.873999999999938 | 0.428 | 0.763 | 1.937 |
| -3.870999999999938 | 0.428 | 0.765 | 1.91 |
| -3.867999999999938 | 0.429 | 0.766 | 1.883 |
| -3.864999999999938 | 0.429 | 0.768 | 1.857 |
| -3.861999999999938 | 0.43 | 0.77 | 1.832 |
| -3.858999999999938 | 0.43 | 0.772 | 1.807 |
| -3.855999999999938 | 0.431 | 0.774 | 1.782 |
| -3.852999999999938 | 0.432 | 0.776 | 1.758 |
| -3.849999999999937 | 0.432 | 0.778 | 1.735 |
| -3.846999999999937 | 0.433 | 0.78 | 1.711 |
| -3.843999999999937 | 0.433 | 0.782 | 1.688 |
| -3.840999999999937 | 0.434 | 0.783 | 1.666 |
| -3.837999999999937 | 0.434 | 0.785 | 1.643 |
| -3.834999999999937 | 0.435 | 0.787 | 1.621 |
| -3.831999999999937 | 0.436 | 0.789 | 1.6 |
| -3.828999999999937 | 0.436 | 0.791 | 1.579 |
| -3.825999999999937 | 0.437 | 0.793 | 1.558 |
| -3.822999999999936 | 0.437 | 0.795 | 1.537 |
| -3.819999999999936 | 0.438 | 0.797 | 1.516 |
| -3.816999999999936 | 0.438 | 0.799 | 1.496 |
| -3.813999999999936 | 0.439 | 0.801 | 1.476 |
| -3.810999999999936 | 0.44 | 0.803 | 1.457 |
| -3.807999999999936 | 0.44 | 0.805 | 1.437 |
| -3.804999999999936 | 0.441 | 0.807 | 1.418 |
| -3.801999999999936 | 0.441 | 0.81 | 1.399 |
| -3.798999999999935 | 0.442 | 0.812 | 1.38 |
| -3.795999999999935 | 0.443 | 0.814 | 1.361 |
| -3.792999999999935 | 0.443 | 0.816 | 1.343 |
| -3.789999999999935 | 0.444 | 0.818 | 1.325 |
| -3.786999999999935 | 0.444 | 0.82 | 1.307 |
| -3.783999999999935 | 0.445 | 0.822 | 1.289 |
| -3.780999999999935 | 0.446 | 0.824 | 1.272 |
| -3.777999999999935 | 0.446 | 0.827 | 1.254 |
| -3.774999999999935 | 0.447 | 0.829 | 1.237 |
| -3.771999999999934 | 0.447 | 0.831 | 1.22 |
| -3.768999999999934 | 0.448 | 0.833 | 1.203 |
| -3.765999999999934 | 0.449 | 0.835 | 1.186 |
| -3.762999999999934 | 0.449 | 0.838 | 1.169 |
| -3.759999999999934 | 0.45 | 0.84 | 1.153 |
| -3.756999999999934 | 0.451 | 0.842 | 1.136 |
| -3.753999999999934 | 0.451 | 0.844 | 1.12 |
| -3.750999999999934 | 0.452 | 0.847 | 1.104 |
| -3.747999999999933 | 0.452 | 0.849 | 1.088 |
| -3.744999999999933 | 0.453 | 0.851 | 1.072 |
| -3.741999999999933 | 0.454 | 0.853 | 1.056 |
| -3.738999999999933 | 0.454 | 0.856 | 1.041 |
| -3.735999999999933 | 0.455 | 0.858 | 1.025 |
| -3.732999999999933 | 0.456 | 0.86 | 1.01 |
| -3.729999999999933 | 0.456 | 0.863 | 0.995 |
| -3.726999999999933 | 0.457 | 0.865 | 0.979 |
| -3.723999999999932 | 0.457 | 0.868 | 0.964 |
| -3.720999999999932 | 0.458 | 0.87 | 0.949 |
| -3.717999999999932 | 0.459 | 0.872 | 0.935 |
| -3.714999999999932 | 0.459 | 0.875 | 0.92 |
| -3.711999999999932 | 0.46 | 0.877 | 0.905 |
| -3.708999999999932 | 0.461 | 0.88 | 0.891 |
| -3.705999999999932 | 0.461 | 0.882 | 0.876 |
| -3.702999999999932 | 0.462 | 0.885 | 0.862 |
| -3.699999999999932 | 0.463 | 0.887 | 0.847 |
| -3.696999999999932 | 0.463 | 0.89 | 0.833 |
| -3.693999999999931 | 0.464 | 0.892 | 0.819 |
| -3.690999999999931 | 0.465 | 0.895 | 0.805 |
| -3.687999999999931 | 0.465 | 0.898 | 0.791 |
| -3.684999999999931 | 0.466 | 0.9 | 0.777 |
| -3.681999999999931 | 0.467 | 0.903 | 0.763 |
| -3.678999999999931 | 0.467 | 0.905 | 0.749 |
| -3.675999999999931 | 0.468 | 0.908 | 0.735 |
| -3.672999999999931 | 0.469 | 0.911 | 0.722 |
| -3.669999999999931 | 0.469 | 0.913 | 0.708 |
| -3.66699999999993 | 0.47 | 0.916 | 0.695 |
| -3.66399999999993 | 0.471 | 0.919 | 0.681 |
| -3.66099999999993 | 0.471 | 0.921 | 0.668 |
| -3.65799999999993 | 0.472 | 0.924 | 0.654 |
| -3.65499999999993 | 0.473 | 0.927 | 0.641 |
| -3.65199999999993 | 0.473 | 0.93 | 0.628 |
| -3.64899999999993 | 0.474 | 0.932 | 0.615 |
| -3.64599999999993 | 0.475 | 0.935 | 0.602 |
| -3.64299999999993 | 0.475 | 0.938 | 0.588 |
| -3.639999999999929 | 0.476 | 0.941 | 0.575 |
| -3.636999999999929 | 0.477 | 0.944 | 0.562 |
| -3.633999999999929 | 0.477 | 0.947 | 0.549 |
| -3.630999999999929 | 0.478 | 0.95 | 0.537 |
| -3.627999999999929 | 0.479 | 0.953 | 0.524 |
| -3.624999999999929 | 0.48 | 0.956 | 0.511 |
| -3.621999999999929 | 0.48 | 0.958 | 0.498 |
| -3.618999999999929 | 0.481 | 0.961 | 0.485 |
| -3.615999999999929 | 0.482 | 0.964 | 0.473 |
| -3.612999999999928 | 0.482 | 0.967 | 0.46 |
| -3.609999999999928 | 0.483 | 0.971 | 0.447 |
| -3.606999999999928 | 0.484 | 0.974 | 0.435 |
| -3.603999999999928 | 0.485 | 0.977 | 0.422 |
| -3.600999999999928 | 0.485 | 0.98 | 0.41 |
| -3.597999999999928 | 0.486 | 0.983 | 0.397 |
| -3.594999999999928 | 0.487 | 0.986 | 0.385 |
| -3.591999999999928 | 0.487 | 0.989 | 0.372 |
| -3.588999999999928 | 0.488 | 0.992 | 0.36 |
| -3.585999999999927 | 0.489 | 0.996 | 0.347 |
| -3.582999999999927 | 0.49 | 0.999 | 0.335 |
| -3.579999999999927 | 0.49 | 1.002 | 0.323 |
| -3.576999999999927 | 0.491 | 1.005 | 0.31 |
| -3.573999999999927 | 0.492 | 1.009 | 0.298 |
| -3.570999999999927 | 0.493 | 1.012 | 0.286 |
| -3.567999999999927 | 0.493 | 1.015 | 0.274 |
| -3.564999999999927 | 0.494 | 1.019 | 0.261 |
| -3.561999999999927 | 0.495 | 1.022 | 0.249 |
| -3.558999999999926 | 0.496 | 1.026 | 0.237 |
| -3.555999999999926 | 0.496 | 1.029 | 0.225 |
| -3.552999999999926 | 0.497 | 1.033 | 0.213 |
| -3.549999999999926 | 0.498 | 1.036 | 0.201 |
| -3.546999999999926 | 0.499 | 1.04 | 0.189 |
| -3.543999999999926 | 0.499 | 1.043 | 0.176 |
| -3.540999999999926 | 0.5 | 1.047 | 0.164 |
| -3.537999999999926 | 0.501 | 1.05 | 0.152 |
| -3.534999999999926 | 0.502 | 1.054 | 0.14 |
| -3.531999999999925 | 0.502 | 1.058 | 0.128 |
| -3.528999999999925 | 0.503 | 1.061 | 0.116 |
| -3.525999999999925 | 0.504 | 1.065 | 0.104 |
| -3.522999999999925 | 0.505 | 1.069 | 0.092 |
| -3.519999999999925 | 0.506 | 1.073 | 0.08 |
| -3.516999999999925 | 0.506 | 1.076 | 0.068 |
| -3.513999999999925 | 0.507 | 1.08 | 0.056 |
| -3.510999999999925 | 0.508 | 1.084 | 0.044 |
| -3.507999999999925 | 0.509 | 1.088 | 0.032 |
| -3.504999999999924 | 0.509 | 1.092 | 0.02 |
| -3.501999999999924 | 0.51 | 1.096 | 0.008 |
| -3.498999999999924 | 0.511 | 1.1 | -0.004 |
| -3.495999999999924 | 0.512 | 1.104 | -0.016 |
| -3.492999999999924 | 0.513 | 1.108 | -0.028 |
| -3.489999999999924 | 0.514 | 1.112 | -0.04 |
| -3.486999999999924 | 0.514 | 1.116 | -0.052 |
| -3.483999999999924 | 0.515 | 1.12 | -0.064 |
| -3.480999999999923 | 0.516 | 1.125 | -0.076 |
| -3.477999999999923 | 0.517 | 1.129 | -0.088 |
| -3.474999999999923 | 0.518 | 1.133 | -0.1 |
| -3.471999999999923 | 0.518 | 1.137 | -0.112 |
| -3.468999999999923 | 0.519 | 1.142 | -0.124 |
| -3.465999999999923 | 0.52 | 1.146 | -0.136 |
| -3.462999999999923 | 0.521 | 1.151 | -0.148 |
| -3.459999999999923 | 0.522 | 1.155 | -0.16 |
| -3.456999999999923 | 0.523 | 1.159 | -0.172 |
| -3.453999999999922 | 0.523 | 1.164 | -0.185 |
| -3.450999999999922 | 0.524 | 1.169 | -0.197 |
| -3.447999999999922 | 0.525 | 1.173 | -0.209 |
| -3.444999999999922 | 0.526 | 1.178 | -0.221 |
| -3.441999999999922 | 0.527 | 1.182 | -0.233 |
| -3.438999999999922 | 0.528 | 1.187 | -0.245 |
| -3.435999999999922 | 0.528 | 1.192 | -0.257 |
| -3.432999999999922 | 0.529 | 1.197 | -0.27 |
| -3.429999999999922 | 0.53 | 1.202 | -0.282 |
| -3.426999999999921 | 0.531 | 1.207 | -0.294 |
| -3.423999999999921 | 0.532 | 1.211 | -0.306 |
| -3.420999999999921 | 0.533 | 1.216 | -0.319 |
| -3.417999999999921 | 0.534 | 1.222 | -0.331 |
| -3.414999999999921 | 0.535 | 1.227 | -0.343 |
| -3.411999999999921 | 0.535 | 1.232 | -0.356 |
| -3.408999999999921 | 0.536 | 1.237 | -0.368 |
| -3.405999999999921 | 0.537 | 1.242 | -0.381 |
| -3.402999999999921 | 0.538 | 1.247 | -0.393 |
| -3.39999999999992 | 0.539 | 1.253 | -0.405 |
| -3.39699999999992 | 0.54 | 1.258 | -0.418 |
| -3.39399999999992 | 0.541 | 1.264 | -0.431 |
| -3.39099999999992 | 0.542 | 1.269 | -0.443 |
| -3.38799999999992 | 0.543 | 1.275 | -0.456 |
| -3.38499999999992 | 0.543 | 1.28 | -0.468 |
| -3.38199999999992 | 0.544 | 1.286 | -0.481 |
| -3.37899999999992 | 0.545 | 1.292 | -0.494 |
| -3.375999999999919 | 0.546 | 1.297 | -0.507 |
| -3.372999999999919 | 0.547 | 1.303 | -0.519 |
| -3.369999999999919 | 0.548 | 1.309 | -0.532 |
| -3.366999999999919 | 0.549 | 1.315 | -0.545 |
| -3.363999999999919 | 0.55 | 1.321 | -0.558 |
| -3.360999999999919 | 0.551 | 1.327 | -0.571 |
| -3.357999999999919 | 0.552 | 1.333 | -0.584 |
| -3.354999999999919 | 0.553 | 1.339 | -0.597 |
| -3.351999999999919 | 0.554 | 1.346 | -0.61 |
| -3.348999999999918 | 0.555 | 1.352 | -0.623 |
| -3.345999999999918 | 0.556 | 1.358 | -0.637 |
| -3.342999999999918 | 0.557 | 1.365 | -0.65 |
| -3.339999999999918 | 0.557 | 1.371 | -0.663 |
| -3.336999999999918 | 0.558 | 1.378 | -0.677 |
| -3.333999999999918 | 0.559 | 1.385 | -0.69 |
| -3.330999999999918 | 0.56 | 1.392 | -0.704 |
| -3.327999999999918 | 0.561 | 1.398 | -0.717 |
| -3.324999999999918 | 0.562 | 1.405 | -0.731 |
| -3.321999999999917 | 0.563 | 1.412 | -0.745 |
| -3.318999999999917 | 0.564 | 1.419 | -0.758 |
| -3.315999999999917 | 0.565 | 1.427 | -0.772 |
| -3.312999999999917 | 0.566 | 1.434 | -0.786 |
| -3.309999999999917 | 0.567 | 1.441 | -0.8 |
| -3.306999999999917 | 0.568 | 1.449 | -0.814 |
| -3.303999999999917 | 0.569 | 1.456 | -0.828 |
| -3.300999999999917 | 0.57 | 1.464 | -0.843 |
| -3.297999999999916 | 0.571 | 1.471 | -0.857 |
| -3.294999999999916 | 0.572 | 1.479 | -0.871 |
| -3.291999999999916 | 0.573 | 1.487 | -0.886 |
| -3.288999999999916 | 0.574 | 1.495 | -0.9 |
| -3.285999999999916 | 0.575 | 1.503 | -0.915 |
| -3.282999999999916 | 0.576 | 1.512 | -0.93 |
| -3.279999999999916 | 0.577 | 1.52 | -0.944 |
| -3.276999999999916 | 0.578 | 1.528 | -0.959 |
| -3.273999999999916 | 0.579 | 1.537 | -0.974 |
| -3.270999999999916 | 0.58 | 1.545 | -0.99 |
| -3.267999999999915 | 0.581 | 1.554 | -1.005 |
| -3.264999999999915 | 0.583 | 1.563 | -1.02 |
| -3.261999999999915 | 0.584 | 1.572 | -1.036 |
| -3.258999999999915 | 0.585 | 1.581 | -1.051 |
| -3.255999999999915 | 0.586 | 1.591 | -1.067 |
| -3.252999999999915 | 0.587 | 1.6 | -1.083 |
| -3.249999999999915 | 0.588 | 1.609 | -1.099 |
| -3.246999999999915 | 0.589 | 1.619 | -1.115 |
| -3.243999999999914 | 0.59 | 1.629 | -1.131 |
| -3.240999999999914 | 0.591 | 1.639 | -1.147 |
| -3.237999999999914 | 0.592 | 1.649 | -1.164 |
| -3.234999999999914 | 0.593 | 1.659 | -1.18 |
| -3.231999999999914 | 0.594 | 1.67 | -1.197 |
| -3.228999999999914 | 0.595 | 1.68 | -1.214 |
| -3.225999999999914 | 0.596 | 1.691 | -1.231 |
| -3.222999999999914 | 0.598 | 1.702 | -1.248 |
| -3.219999999999914 | 0.599 | 1.713 | -1.266 |
| -3.216999999999913 | 0.6 | 1.724 | -1.283 |
| -3.213999999999913 | 0.601 | 1.736 | -1.301 |
| -3.210999999999913 | 0.602 | 1.747 | -1.319 |
| -3.207999999999913 | 0.603 | 1.759 | -1.337 |
| -3.204999999999913 | 0.604 | 1.771 | -1.355 |
| -3.201999999999913 | 0.605 | 1.783 | -1.374 |
| -3.198999999999913 | 0.607 | 1.796 | -1.393 |
| -3.195999999999913 | 0.608 | 1.809 | -1.411 |
| -3.192999999999913 | 0.609 | 1.822 | -1.431 |
| -3.189999999999912 | 0.61 | 1.835 | -1.45 |
| -3.186999999999912 | 0.611 | 1.848 | -1.47 |
| -3.183999999999912 | 0.612 | 1.862 | -1.489 |
| -3.180999999999912 | 0.613 | 1.876 | -1.51 |
| -3.177999999999912 | 0.615 | 1.89 | -1.53 |
| -3.174999999999912 | 0.616 | 1.904 | -1.551 |
| -3.171999999999912 | 0.617 | 1.919 | -1.572 |
| -3.168999999999912 | 0.618 | 1.934 | -1.593 |
| -3.165999999999912 | 0.619 | 1.949 | -1.614 |
| -3.162999999999911 | 0.62 | 1.965 | -1.636 |
| -3.159999999999911 | 0.622 | 1.981 | -1.658 |
| -3.156999999999911 | 0.623 | 1.997 | -1.681 |
| -3.153999999999911 | 0.624 | 2.014 | -1.704 |
| -3.150999999999911 | 0.625 | 2.031 | -1.727 |
| -3.147999999999911 | 0.627 | 2.049 | -1.75 |
| -3.144999999999911 | 0.628 | 2.066 | -1.774 |
| -3.141999999999911 | 0.629 | 2.085 | -1.799 |
| -3.138999999999911 | 0.63 | 2.103 | -1.824 |
| -3.13599999999991 | 0.631 | 2.123 | -1.849 |
| -3.13299999999991 | 0.633 | 2.142 | -1.875 |
| -3.12999999999991 | 0.634 | 2.162 | -1.901 |
| -3.12699999999991 | 0.635 | 2.183 | -1.928 |
| -3.12399999999991 | 0.636 | 2.204 | -1.955 |
| -3.12099999999991 | 0.638 | 2.226 | -1.983 |
| -3.11799999999991 | 0.639 | 2.249 | -2.012 |
| -3.11499999999991 | 0.64 | 2.272 | -2.041 |
| -3.111999999999909 | 0.641 | 2.295 | -2.07 |
| -3.108999999999909 | 0.643 | 2.32 | -2.101 |
| -3.105999999999909 | 0.644 | 2.345 | -2.132 |
| -3.102999999999909 | 0.645 | 2.371 | -2.164 |
| -3.099999999999909 | 0.647 | 2.398 | -2.197 |
| -3.096999999999909 | 0.648 | 2.426 | -2.231 |
| -3.093999999999909 | 0.649 | 2.454 | -2.266 |
| -3.090999999999909 | 0.651 | 2.484 | -2.301 |
| -3.087999999999909 | 0.652 | 2.515 | -2.338 |
| -3.084999999999908 | 0.653 | 2.547 | -2.376 |
| -3.081999999999908 | 0.655 | 2.58 | -2.415 |
| -3.078999999999908 | 0.656 | 2.614 | -2.456 |
| -3.075999999999908 | 0.657 | 2.65 | -2.498 |
| -3.072999999999908 | 0.659 | 2.688 | -2.541 |
| -3.069999999999908 | 0.66 | 2.727 | -2.587 |
| -3.066999999999908 | 0.661 | 2.768 | -2.634 |
| -3.063999999999908 | 0.663 | 2.811 | -2.683 |
| -3.060999999999908 | 0.664 | 2.856 | -2.734 |
| -3.057999999999907 | 0.665 | 2.904 | -2.788 |
| -3.054999999999907 | 0.667 | 2.954 | -2.844 |
| -3.051999999999907 | 0.668 | 3.007 | -2.903 |
| -3.048999999999907 | 0.67 | 3.064 | -2.966 |
| -3.045999999999907 | 0.671 | 3.124 | -3.032 |
| -3.042999999999907 | 0.672 | 3.189 | -3.103 |
| -3.039999999999907 | 0.674 | 3.258 | -3.178 |
| -3.036999999999907 | 0.675 | 3.333 | -3.259 |
| -3.033999999999907 | 0.677 | 3.415 | -3.347 |
| -3.030999999999906 | 0.678 | 3.504 | -3.442 |
| -3.027999999999906 | 0.679 | 3.603 | -3.547 |
| -3.024999999999906 | 0.681 | 3.714 | -3.664 |
| -3.021999999999906 | 0.682 | 3.838 | -3.794 |
| -3.018999999999906 | 0.684 | 3.982 | -3.944 |
| -3.015999999999906 | 0.685 | 4.151 | -4.119 |
| -3.012999999999906 | 0.687 | 4.356 | -4.33 |
| -3.009999999999906 | 0.688 | 4.615 | -4.595 |
| -3.006999999999906 | 0.69 | 4.969 | -4.955 |
| -3.003999999999905 | 0.691 | 5.525 | -5.517 |
| -3.000999999999905 | 0.693 | 6.909 | -6.907 |
| -2.997999999999905 | 0.694 | 6.213 | -6.217 |
| -2.994999999999905 | 0.696 | 5.293 | -5.303 |
| -2.991999999999905 | 0.697 | 4.82 | -4.836 |
| -2.988999999999905 | 0.699 | 4.499 | -4.521 |
| -2.985999999999905 | 0.7 | 4.255 | -4.283 |
| -2.982999999999905 | 0.702 | 4.057 | -4.091 |
| -2.979999999999904 | 0.703 | 3.892 | -3.932 |
| -2.976999999999904 | 0.705 | 3.749 | -3.795 |
| -2.973999999999904 | 0.706 | 3.623 | -3.675 |
| -2.970999999999904 | 0.708 | 3.511 | -3.569 |
| -2.967999999999904 | 0.71 | 3.409 | -3.474 |
| -2.964999999999904 | 0.711 | 3.317 | -3.387 |
| -2.961999999999904 | 0.713 | 3.231 | -3.307 |
| -2.958999999999904 | 0.714 | 3.152 | -3.234 |
| -2.955999999999904 | 0.716 | 3.079 | -3.167 |
| -2.952999999999903 | 0.718 | 3.009 | -3.104 |
| -2.949999999999903 | 0.719 | 2.944 | -3.045 |
| -2.946999999999903 | 0.721 | 2.883 | -2.989 |
| -2.943999999999903 | 0.722 | 2.825 | -2.937 |
| -2.940999999999903 | 0.724 | 2.769 | -2.888 |
| -2.937999999999903 | 0.726 | 2.717 | -2.841 |
| -2.934999999999903 | 0.727 | 2.666 | -2.796 |
| -2.931999999999903 | 0.729 | 2.618 | -2.754 |
| -2.928999999999903 | 0.731 | 2.571 | -2.714 |
| -2.925999999999902 | 0.732 | 2.527 | -2.675 |
| -2.922999999999902 | 0.734 | 2.484 | -2.638 |
| -2.919999999999902 | 0.736 | 2.442 | -2.603 |
| -2.916999999999902 | 0.737 | 2.402 | -2.569 |
| -2.913999999999902 | 0.739 | 2.363 | -2.536 |
| -2.910999999999902 | 0.741 | 2.326 | -2.504 |
| -2.907999999999902 | 0.743 | 2.289 | -2.474 |
| -2.904999999999902 | 0.744 | 2.254 | -2.445 |
| -2.901999999999902 | 0.746 | 2.22 | -2.416 |
| -2.898999999999901 | 0.748 | 2.186 | -2.389 |
| -2.895999999999901 | 0.75 | 2.154 | -2.362 |
| -2.892999999999901 | 0.751 | 2.122 | -2.337 |
| -2.889999999999901 | 0.753 | 2.091 | -2.312 |
| -2.886999999999901 | 0.755 | 2.06 | -2.287 |
| -2.883999999999901 | 0.757 | 2.031 | -2.264 |
| -2.880999999999901 | 0.759 | 2.002 | -2.241 |
| -2.877999999999901 | 0.76 | 1.974 | -2.219 |
| -2.8749999999999 | 0.762 | 1.946 | -2.197 |
| -2.8719999999999 | 0.764 | 1.919 | -2.176 |
| -2.8689999999999 | 0.766 | 1.892 | -2.156 |
| -2.8659999999999 | 0.768 | 1.866 | -2.136 |
| -2.8629999999999 | 0.77 | 1.84 | -2.116 |
| -2.8599999999999 | 0.771 | 1.815 | -2.097 |
| -2.8569999999999 | 0.773 | 1.791 | -2.079 |
| -2.8539999999999 | 0.775 | 1.766 | -2.06 |
| -2.8509999999999 | 0.777 | 1.742 | -2.043 |
| -2.847999999999899 | 0.779 | 1.719 | -2.025 |
| -2.844999999999899 | 0.781 | 1.696 | -2.008 |
| -2.841999999999899 | 0.783 | 1.673 | -1.992 |
| -2.838999999999899 | 0.785 | 1.651 | -1.976 |
| -2.835999999999899 | 0.787 | 1.629 | -1.96 |
| -2.832999999999899 | 0.789 | 1.607 | -1.944 |
| -2.829999999999899 | 0.791 | 1.586 | -1.929 |
| -2.826999999999899 | 0.793 | 1.565 | -1.914 |
| -2.823999999999899 | 0.795 | 1.544 | -1.899 |
| -2.820999999999898 | 0.797 | 1.523 | -1.885 |
| -2.817999999999898 | 0.799 | 1.503 | -1.871 |
| -2.814999999999898 | 0.801 | 1.483 | -1.857 |
| -2.811999999999898 | 0.803 | 1.463 | -1.844 |
| -2.808999999999898 | 0.805 | 1.444 | -1.83 |
| -2.805999999999898 | 0.807 | 1.424 | -1.817 |
| -2.802999999999898 | 0.809 | 1.405 | -1.804 |
| -2.799999999999898 | 0.811 | 1.386 | -1.792 |
| -2.796999999999897 | 0.813 | 1.368 | -1.779 |
| -2.793999999999897 | 0.815 | 1.349 | -1.767 |
| -2.790999999999897 | 0.817 | 1.331 | -1.755 |
| -2.787999999999897 | 0.819 | 1.313 | -1.743 |
| -2.784999999999897 | 0.821 | 1.295 | -1.732 |
| -2.781999999999897 | 0.824 | 1.277 | -1.72 |
| -2.778999999999897 | 0.826 | 1.26 | -1.709 |
| -2.775999999999897 | 0.828 | 1.243 | -1.698 |
| -2.772999999999897 | 0.83 | 1.225 | -1.687 |
| -2.769999999999896 | 0.832 | 1.208 | -1.677 |
| -2.766999999999896 | 0.835 | 1.191 | -1.666 |
| -2.763999999999896 | 0.837 | 1.175 | -1.656 |
| -2.760999999999896 | 0.839 | 1.158 | -1.646 |
| -2.757999999999896 | 0.841 | 1.142 | -1.636 |
| -2.754999999999896 | 0.844 | 1.125 | -1.626 |
| -2.751999999999896 | 0.846 | 1.109 | -1.616 |
| -2.748999999999896 | 0.848 | 1.093 | -1.606 |
| -2.745999999999896 | 0.85 | 1.077 | -1.597 |
| -2.742999999999895 | 0.853 | 1.062 | -1.587 |
| -2.739999999999895 | 0.855 | 1.046 | -1.578 |
| -2.736999999999895 | 0.857 | 1.03 | -1.569 |
| -2.733999999999895 | 0.86 | 1.015 | -1.56 |
| -2.730999999999895 | 0.862 | 1 | -1.551 |
| -2.727999999999895 | 0.864 | 0.984 | -1.543 |
| -2.724999999999895 | 0.867 | 0.969 | -1.534 |
| -2.721999999999895 | 0.869 | 0.954 | -1.525 |
| -2.718999999999895 | 0.872 | 0.94 | -1.517 |
| -2.715999999999894 | 0.874 | 0.925 | -1.509 |
| -2.712999999999894 | 0.877 | 0.91 | -1.501 |
| -2.709999999999894 | 0.879 | 0.895 | -1.493 |
| -2.706999999999894 | 0.881 | 0.881 | -1.485 |
| -2.703999999999894 | 0.884 | 0.866 | -1.477 |
| -2.700999999999894 | 0.886 | 0.852 | -1.469 |
| -2.697999999999894 | 0.889 | 0.838 | -1.461 |
| -2.694999999999894 | 0.892 | 0.824 | -1.454 |
| -2.691999999999893 | 0.894 | 0.809 | -1.446 |
| -2.688999999999893 | 0.897 | 0.795 | -1.439 |
| -2.685999999999893 | 0.899 | 0.781 | -1.431 |
| -2.682999999999893 | 0.902 | 0.768 | -1.424 |
| -2.679999999999893 | 0.904 | 0.754 | -1.417 |
| -2.676999999999893 | 0.907 | 0.74 | -1.41 |
| -2.673999999999893 | 0.91 | 0.726 | -1.403 |
| -2.670999999999893 | 0.912 | 0.713 | -1.396 |
| -2.667999999999893 | 0.915 | 0.699 | -1.389 |
| -2.664999999999892 | 0.918 | 0.686 | -1.383 |
| -2.661999999999892 | 0.921 | 0.672 | -1.376 |
| -2.658999999999892 | 0.923 | 0.659 | -1.369 |
| -2.655999999999892 | 0.926 | 0.646 | -1.363 |
| -2.652999999999892 | 0.929 | 0.632 | -1.356 |
| -2.649999999999892 | 0.932 | 0.619 | -1.35 |
| -2.646999999999892 | 0.934 | 0.606 | -1.344 |
| -2.643999999999892 | 0.937 | 0.593 | -1.337 |
| -2.640999999999892 | 0.94 | 0.58 | -1.331 |
| -2.637999999999891 | 0.943 | 0.567 | -1.325 |
| -2.634999999999891 | 0.946 | 0.554 | -1.319 |
| -2.631999999999891 | 0.949 | 0.541 | -1.313 |
| -2.628999999999891 | 0.952 | 0.528 | -1.307 |
| -2.625999999999891 | 0.955 | 0.515 | -1.301 |
| -2.622999999999891 | 0.957 | 0.502 | -1.295 |
| -2.619999999999891 | 0.96 | 0.49 | -1.29 |
| -2.616999999999891 | 0.963 | 0.477 | -1.284 |
| -2.613999999999891 | 0.966 | 0.464 | -1.278 |
| -2.61099999999989 | 0.97 | 0.452 | -1.273 |
| -2.60799999999989 | 0.973 | 0.439 | -1.267 |
| -2.60499999999989 | 0.976 | 0.426 | -1.262 |
| -2.60199999999989 | 0.979 | 0.414 | -1.256 |
| -2.59899999999989 | 0.982 | 0.401 | -1.251 |
| -2.59599999999989 | 0.985 | 0.389 | -1.246 |
| -2.59299999999989 | 0.988 | 0.376 | -1.24 |
| -2.58999999999989 | 0.991 | 0.364 | -1.235 |
| -2.58699999999989 | 0.995 | 0.352 | -1.23 |
| -2.583999999999889 | 0.998 | 0.339 | -1.225 |
| -2.580999999999889 | 1.001 | 0.327 | -1.22 |
| -2.577999999999889 | 1.004 | 0.315 | -1.215 |
| -2.574999999999889 | 1.008 | 0.302 | -1.21 |
| -2.571999999999889 | 1.011 | 0.29 | -1.205 |
| -2.568999999999889 | 1.014 | 0.278 | -1.2 |
| -2.565999999999889 | 1.018 | 0.266 | -1.195 |
| -2.562999999999889 | 1.021 | 0.253 | -1.19 |
| -2.559999999999889 | 1.025 | 0.241 | -1.186 |
| -2.556999999999888 | 1.028 | 0.229 | -1.181 |
| -2.553999999999888 | 1.031 | 0.217 | -1.176 |
| -2.550999999999888 | 1.035 | 0.205 | -1.172 |
| -2.547999999999888 | 1.038 | 0.193 | -1.167 |
| -2.544999999999888 | 1.042 | 0.18 | -1.162 |
| -2.541999999999888 | 1.046 | 0.168 | -1.158 |
| -2.538999999999888 | 1.049 | 0.156 | -1.153 |
| -2.535999999999888 | 1.053 | 0.144 | -1.149 |
| -2.532999999999888 | 1.056 | 0.132 | -1.145 |
| -2.529999999999887 | 1.06 | 0.12 | -1.14 |
| -2.526999999999887 | 1.064 | 0.108 | -1.136 |
| -2.523999999999887 | 1.068 | 0.096 | -1.132 |
| -2.520999999999887 | 1.071 | 0.084 | -1.127 |
| -2.517999999999887 | 1.075 | 0.072 | -1.123 |
| -2.514999999999887 | 1.079 | 0.06 | -1.119 |
| -2.511999999999887 | 1.083 | 0.048 | -1.115 |
| -2.508999999999887 | 1.087 | 0.036 | -1.111 |
| -2.505999999999887 | 1.091 | 0.024 | -1.107 |
| -2.502999999999886 | 1.095 | 0.012 | -1.103 |
| -2.499999999999886 | 1.099 | 0 | -1.099 |
| -2.496999999999886 | 1.103 | -0.012 | -1.095 |
| -2.493999999999886 | 1.107 | -0.024 | -1.091 |
| -2.490999999999886 | 1.111 | -0.036 | -1.087 |
| -2.487999999999886 | 1.115 | -0.048 | -1.083 |
| -2.484999999999886 | 1.119 | -0.06 | -1.079 |
| -2.481999999999886 | 1.123 | -0.072 | -1.075 |
| -2.478999999999885 | 1.127 | -0.084 | -1.071 |
| -2.475999999999885 | 1.132 | -0.096 | -1.068 |
| -2.472999999999885 | 1.136 | -0.108 | -1.064 |
| -2.469999999999885 | 1.14 | -0.12 | -1.06 |
| -2.466999999999885 | 1.145 | -0.132 | -1.056 |
| -2.463999999999885 | 1.149 | -0.144 | -1.053 |
| -2.460999999999885 | 1.153 | -0.156 | -1.049 |
| -2.457999999999885 | 1.158 | -0.168 | -1.046 |
| -2.454999999999885 | 1.162 | -0.18 | -1.042 |
| -2.451999999999884 | 1.167 | -0.193 | -1.038 |
| -2.448999999999884 | 1.172 | -0.205 | -1.035 |
| -2.445999999999884 | 1.176 | -0.217 | -1.031 |
| -2.442999999999884 | 1.181 | -0.229 | -1.028 |
| -2.439999999999884 | 1.186 | -0.241 | -1.025 |
| -2.436999999999884 | 1.19 | -0.253 | -1.021 |
| -2.433999999999884 | 1.195 | -0.266 | -1.018 |
| -2.430999999999884 | 1.2 | -0.278 | -1.014 |
| -2.427999999999884 | 1.205 | -0.29 | -1.011 |
| -2.424999999999883 | 1.21 | -0.302 | -1.008 |
| -2.421999999999883 | 1.215 | -0.315 | -1.004 |
| -2.418999999999883 | 1.22 | -0.327 | -1.001 |
| -2.415999999999883 | 1.225 | -0.339 | -0.998 |
| -2.412999999999883 | 1.23 | -0.352 | -0.995 |
| -2.409999999999883 | 1.235 | -0.364 | -0.991 |
| -2.406999999999883 | 1.24 | -0.376 | -0.988 |
| -2.403999999999883 | 1.246 | -0.389 | -0.985 |
| -2.400999999999883 | 1.251 | -0.401 | -0.982 |
| -2.397999999999882 | 1.256 | -0.414 | -0.979 |
| -2.394999999999882 | 1.262 | -0.426 | -0.976 |
| -2.391999999999882 | 1.267 | -0.439 | -0.973 |
| -2.388999999999882 | 1.273 | -0.452 | -0.97 |
| -2.385999999999882 | 1.278 | -0.464 | -0.966 |
| -2.382999999999882 | 1.284 | -0.477 | -0.963 |
| -2.379999999999882 | 1.29 | -0.49 | -0.96 |
| -2.376999999999882 | 1.295 | -0.502 | -0.957 |
| -2.373999999999881 | 1.301 | -0.515 | -0.955 |
| -2.370999999999881 | 1.307 | -0.528 | -0.952 |
| -2.367999999999881 | 1.313 | -0.541 | -0.949 |
| -2.364999999999881 | 1.319 | -0.554 | -0.946 |
| -2.361999999999881 | 1.325 | -0.567 | -0.943 |
| -2.358999999999881 | 1.331 | -0.58 | -0.94 |
| -2.355999999999881 | 1.337 | -0.593 | -0.937 |
| -2.352999999999881 | 1.344 | -0.606 | -0.934 |
| -2.349999999999881 | 1.35 | -0.619 | -0.932 |
| -2.34699999999988 | 1.356 | -0.632 | -0.929 |
| -2.34399999999988 | 1.363 | -0.646 | -0.926 |
| -2.34099999999988 | 1.369 | -0.659 | -0.923 |
| -2.33799999999988 | 1.376 | -0.672 | -0.921 |
| -2.33499999999988 | 1.383 | -0.686 | -0.918 |
| -2.33199999999988 | 1.389 | -0.699 | -0.915 |
| -2.32899999999988 | 1.396 | -0.713 | -0.912 |
| -2.32599999999988 | 1.403 | -0.726 | -0.91 |
| -2.32299999999988 | 1.41 | -0.74 | -0.907 |
| -2.319999999999879 | 1.417 | -0.754 | -0.904 |
| -2.316999999999879 | 1.424 | -0.768 | -0.902 |
| -2.313999999999879 | 1.431 | -0.781 | -0.899 |
| -2.310999999999879 | 1.439 | -0.795 | -0.897 |
| -2.307999999999879 | 1.446 | -0.809 | -0.894 |
| -2.304999999999879 | 1.454 | -0.824 | -0.892 |
| -2.301999999999879 | 1.461 | -0.838 | -0.889 |
| -2.298999999999879 | 1.469 | -0.852 | -0.886 |
| -2.295999999999879 | 1.477 | -0.866 | -0.884 |
| -2.292999999999878 | 1.485 | -0.881 | -0.881 |
| -2.289999999999878 | 1.493 | -0.895 | -0.879 |
| -2.286999999999878 | 1.501 | -0.91 | -0.877 |
| -2.283999999999878 | 1.509 | -0.925 | -0.874 |
| -2.280999999999878 | 1.517 | -0.94 | -0.872 |
| -2.277999999999878 | 1.525 | -0.954 | -0.869 |
| -2.274999999999878 | 1.534 | -0.969 | -0.867 |
| -2.271999999999878 | 1.543 | -0.984 | -0.864 |
| -2.268999999999878 | 1.551 | -1 | -0.862 |
| -2.265999999999877 | 1.56 | -1.015 | -0.86 |
| -2.262999999999877 | 1.569 | -1.03 | -0.857 |
| -2.259999999999877 | 1.578 | -1.046 | -0.855 |
| -2.256999999999877 | 1.587 | -1.062 | -0.853 |
| -2.253999999999877 | 1.597 | -1.077 | -0.85 |
| -2.250999999999877 | 1.606 | -1.093 | -0.848 |
| -2.247999999999877 | 1.616 | -1.109 | -0.846 |
| -2.244999999999877 | 1.626 | -1.125 | -0.844 |
| -2.241999999999877 | 1.636 | -1.142 | -0.841 |
| -2.238999999999876 | 1.646 | -1.158 | -0.839 |
| -2.235999999999876 | 1.656 | -1.175 | -0.837 |
| -2.232999999999876 | 1.666 | -1.191 | -0.835 |
| -2.229999999999876 | 1.677 | -1.208 | -0.832 |
| -2.226999999999876 | 1.687 | -1.225 | -0.83 |
| -2.223999999999876 | 1.698 | -1.243 | -0.828 |
| -2.220999999999876 | 1.709 | -1.26 | -0.826 |
| -2.217999999999876 | 1.72 | -1.277 | -0.824 |
| -2.214999999999875 | 1.732 | -1.295 | -0.821 |
| -2.211999999999875 | 1.743 | -1.313 | -0.819 |
| -2.208999999999875 | 1.755 | -1.331 | -0.817 |
| -2.205999999999875 | 1.767 | -1.349 | -0.815 |
| -2.202999999999875 | 1.779 | -1.368 | -0.813 |
| -2.199999999999875 | 1.792 | -1.386 | -0.811 |
| -2.196999999999875 | 1.804 | -1.405 | -0.809 |
| -2.193999999999875 | 1.817 | -1.424 | -0.807 |
| -2.190999999999875 | 1.83 | -1.444 | -0.805 |
| -2.187999999999874 | 1.844 | -1.463 | -0.803 |
| -2.184999999999874 | 1.857 | -1.483 | -0.801 |
| -2.181999999999874 | 1.871 | -1.503 | -0.799 |
| -2.178999999999874 | 1.885 | -1.523 | -0.797 |
| -2.175999999999874 | 1.899 | -1.544 | -0.795 |
| -2.172999999999874 | 1.914 | -1.565 | -0.793 |
| -2.169999999999874 | 1.929 | -1.586 | -0.791 |
| -2.166999999999874 | 1.944 | -1.607 | -0.789 |
| -2.163999999999874 | 1.96 | -1.629 | -0.787 |
| -2.160999999999873 | 1.976 | -1.651 | -0.785 |
| -2.157999999999873 | 1.992 | -1.673 | -0.783 |
| -2.154999999999873 | 2.008 | -1.696 | -0.781 |
| -2.151999999999873 | 2.025 | -1.719 | -0.779 |
| -2.148999999999873 | 2.043 | -1.742 | -0.777 |
| -2.145999999999873 | 2.06 | -1.766 | -0.775 |
| -2.142999999999873 | 2.079 | -1.791 | -0.773 |
| -2.139999999999873 | 2.097 | -1.815 | -0.771 |
| -2.136999999999873 | 2.116 | -1.84 | -0.77 |
| -2.133999999999872 | 2.136 | -1.866 | -0.768 |
| -2.130999999999872 | 2.156 | -1.892 | -0.766 |
| -2.127999999999872 | 2.176 | -1.919 | -0.764 |
| -2.124999999999872 | 2.197 | -1.946 | -0.762 |
| -2.121999999999872 | 2.219 | -1.974 | -0.76 |
| -2.118999999999872 | 2.241 | -2.002 | -0.759 |
| -2.115999999999872 | 2.264 | -2.031 | -0.757 |
| -2.112999999999872 | 2.287 | -2.06 | -0.755 |
| -2.109999999999872 | 2.312 | -2.091 | -0.753 |
| -2.106999999999871 | 2.337 | -2.122 | -0.751 |
| -2.103999999999871 | 2.362 | -2.154 | -0.75 |
| -2.100999999999871 | 2.389 | -2.186 | -0.748 |
| -2.097999999999871 | 2.416 | -2.22 | -0.746 |
| -2.094999999999871 | 2.445 | -2.254 | -0.744 |
| -2.091999999999871 | 2.474 | -2.289 | -0.743 |
| -2.088999999999871 | 2.504 | -2.326 | -0.741 |
| -2.085999999999871 | 2.536 | -2.363 | -0.739 |
| -2.08299999999987 | 2.569 | -2.402 | -0.737 |
| -2.07999999999987 | 2.603 | -2.442 | -0.736 |
| -2.07699999999987 | 2.638 | -2.484 | -0.734 |
| -2.07399999999987 | 2.675 | -2.527 | -0.732 |
| -2.07099999999987 | 2.714 | -2.571 | -0.731 |
| -2.06799999999987 | 2.754 | -2.618 | -0.729 |
| -2.06499999999987 | 2.796 | -2.666 | -0.727 |
| -2.06199999999987 | 2.841 | -2.717 | -0.726 |
| -2.05899999999987 | 2.888 | -2.769 | -0.724 |
| -2.055999999999869 | 2.937 | -2.825 | -0.722 |
| -2.052999999999869 | 2.989 | -2.883 | -0.721 |
| -2.049999999999869 | 3.045 | -2.944 | -0.719 |
| -2.046999999999869 | 3.104 | -3.009 | -0.718 |
| -2.043999999999869 | 3.167 | -3.079 | -0.716 |
| -2.040999999999869 | 3.234 | -3.152 | -0.714 |
| -2.037999999999869 | 3.307 | -3.231 | -0.713 |
| -2.034999999999869 | 3.387 | -3.317 | -0.711 |
| -2.031999999999869 | 3.474 | -3.409 | -0.71 |
| -2.028999999999868 | 3.569 | -3.511 | -0.708 |
| -2.025999999999868 | 3.675 | -3.623 | -0.706 |
| -2.022999999999868 | 3.795 | -3.749 | -0.705 |
| -2.019999999999868 | 3.932 | -3.892 | -0.703 |
| -2.016999999999868 | 4.091 | -4.057 | -0.702 |
| -2.013999999999868 | 4.283 | -4.255 | -0.7 |
| -2.010999999999868 | 4.521 | -4.499 | -0.699 |
| -2.007999999999868 | 4.836 | -4.82 | -0.697 |
| -2.004999999999868 | 5.303 | -5.293 | -0.696 |
| -2.001999999999867 | 6.217 | -6.213 | -0.694 |
| -1.998999999999868 | 6.907 | -6.909 | -0.693 |
| -1.995999999999868 | 5.517 | -5.525 | -0.691 |
| -1.992999999999868 | 4.955 | -4.969 | -0.69 |
| -1.989999999999868 | 4.595 | -4.615 | -0.688 |
| -1.986999999999868 | 4.33 | -4.356 | -0.687 |
| -1.983999999999868 | 4.119 | -4.151 | -0.685 |
| -1.980999999999868 | 3.944 | -3.982 | -0.684 |
| -1.977999999999868 | 3.794 | -3.838 | -0.682 |
| -1.974999999999868 | 3.664 | -3.714 | -0.681 |
| -1.971999999999868 | 3.547 | -3.603 | -0.679 |
| -1.968999999999869 | 3.442 | -3.504 | -0.678 |
| -1.965999999999869 | 3.347 | -3.415 | -0.677 |
| -1.962999999999869 | 3.259 | -3.333 | -0.675 |
| -1.959999999999869 | 3.178 | -3.258 | -0.674 |
| -1.956999999999869 | 3.103 | -3.189 | -0.672 |
| -1.953999999999869 | 3.032 | -3.124 | -0.671 |
| -1.950999999999869 | 2.966 | -3.064 | -0.67 |
| -1.947999999999869 | 2.903 | -3.007 | -0.668 |
| -1.944999999999869 | 2.844 | -2.954 | -0.667 |
| -1.94199999999987 | 2.788 | -2.904 | -0.665 |
| -1.93899999999987 | 2.734 | -2.856 | -0.664 |
| -1.93599999999987 | 2.683 | -2.811 | -0.663 |
| -1.93299999999987 | 2.634 | -2.768 | -0.661 |
| -1.92999999999987 | 2.587 | -2.727 | -0.66 |
| -1.92699999999987 | 2.541 | -2.688 | -0.659 |
| -1.92399999999987 | 2.498 | -2.65 | -0.657 |
| -1.92099999999987 | 2.456 | -2.614 | -0.656 |
| -1.91799999999987 | 2.415 | -2.58 | -0.655 |
| -1.914999999999871 | 2.376 | -2.547 | -0.653 |
| -1.911999999999871 | 2.338 | -2.515 | -0.652 |
| -1.908999999999871 | 2.301 | -2.484 | -0.651 |
| -1.905999999999871 | 2.266 | -2.454 | -0.649 |
| -1.902999999999871 | 2.231 | -2.426 | -0.648 |
| -1.899999999999871 | 2.197 | -2.398 | -0.647 |
| -1.896999999999871 | 2.164 | -2.371 | -0.645 |
| -1.893999999999871 | 2.132 | -2.345 | -0.644 |
| -1.890999999999871 | 2.101 | -2.32 | -0.643 |
| -1.887999999999871 | 2.07 | -2.295 | -0.641 |
| -1.884999999999872 | 2.041 | -2.272 | -0.64 |
| -1.881999999999872 | 2.012 | -2.249 | -0.639 |
| -1.878999999999872 | 1.983 | -2.226 | -0.638 |
| -1.875999999999872 | 1.955 | -2.204 | -0.636 |
| -1.872999999999872 | 1.928 | -2.183 | -0.635 |
| -1.869999999999872 | 1.901 | -2.162 | -0.634 |
| -1.866999999999872 | 1.875 | -2.142 | -0.633 |
| -1.863999999999872 | 1.849 | -2.123 | -0.631 |
| -1.860999999999872 | 1.824 | -2.103 | -0.63 |
| -1.857999999999873 | 1.799 | -2.085 | -0.629 |
| -1.854999999999873 | 1.774 | -2.066 | -0.628 |
| -1.851999999999873 | 1.75 | -2.049 | -0.627 |
| -1.848999999999873 | 1.727 | -2.031 | -0.625 |
| -1.845999999999873 | 1.704 | -2.014 | -0.624 |
| -1.842999999999873 | 1.681 | -1.997 | -0.623 |
| -1.839999999999873 | 1.658 | -1.981 | -0.622 |
| -1.836999999999873 | 1.636 | -1.965 | -0.62 |
| -1.833999999999873 | 1.614 | -1.949 | -0.619 |
| -1.830999999999874 | 1.593 | -1.934 | -0.618 |
| -1.827999999999874 | 1.572 | -1.919 | -0.617 |
| -1.824999999999874 | 1.551 | -1.904 | -0.616 |
| -1.821999999999874 | 1.53 | -1.89 | -0.615 |
| -1.818999999999874 | 1.51 | -1.876 | -0.613 |
| -1.815999999999874 | 1.489 | -1.862 | -0.612 |
| -1.812999999999874 | 1.47 | -1.848 | -0.611 |
| -1.809999999999874 | 1.45 | -1.835 | -0.61 |
| -1.806999999999874 | 1.431 | -1.822 | -0.609 |
| -1.803999999999875 | 1.411 | -1.809 | -0.608 |
| -1.800999999999875 | 1.393 | -1.796 | -0.607 |
| -1.797999999999875 | 1.374 | -1.783 | -0.605 |
| -1.794999999999875 | 1.355 | -1.771 | -0.604 |
| -1.791999999999875 | 1.337 | -1.759 | -0.603 |
| -1.788999999999875 | 1.319 | -1.747 | -0.602 |
| -1.785999999999875 | 1.301 | -1.736 | -0.601 |
| -1.782999999999875 | 1.283 | -1.724 | -0.6 |
| -1.779999999999875 | 1.266 | -1.713 | -0.599 |
| -1.776999999999875 | 1.248 | -1.702 | -0.598 |
| -1.773999999999876 | 1.231 | -1.691 | -0.596 |
| -1.770999999999876 | 1.214 | -1.68 | -0.595 |
| -1.767999999999876 | 1.197 | -1.67 | -0.594 |
| -1.764999999999876 | 1.18 | -1.659 | -0.593 |
| -1.761999999999876 | 1.164 | -1.649 | -0.592 |
| -1.758999999999876 | 1.147 | -1.639 | -0.591 |
| -1.755999999999876 | 1.131 | -1.629 | -0.59 |
| -1.752999999999876 | 1.115 | -1.619 | -0.589 |
| -1.749999999999876 | 1.099 | -1.609 | -0.588 |
| -1.746999999999877 | 1.083 | -1.6 | -0.587 |
| -1.743999999999877 | 1.067 | -1.591 | -0.586 |
| -1.740999999999877 | 1.051 | -1.581 | -0.585 |
| -1.737999999999877 | 1.036 | -1.572 | -0.584 |
| -1.734999999999877 | 1.02 | -1.563 | -0.583 |
| -1.731999999999877 | 1.005 | -1.554 | -0.581 |
| -1.728999999999877 | 0.99 | -1.545 | -0.58 |
| -1.725999999999877 | 0.974 | -1.537 | -0.579 |
| -1.722999999999877 | 0.959 | -1.528 | -0.578 |
| -1.719999999999878 | 0.944 | -1.52 | -0.577 |
| -1.716999999999878 | 0.93 | -1.512 | -0.576 |
| -1.713999999999878 | 0.915 | -1.503 | -0.575 |
| -1.710999999999878 | 0.9 | -1.495 | -0.574 |
| -1.707999999999878 | 0.886 | -1.487 | -0.573 |
| -1.704999999999878 | 0.871 | -1.479 | -0.572 |
| -1.701999999999878 | 0.857 | -1.471 | -0.571 |
| -1.698999999999878 | 0.843 | -1.464 | -0.57 |
| -1.695999999999878 | 0.828 | -1.456 | -0.569 |
| -1.692999999999878 | 0.814 | -1.449 | -0.568 |
| -1.689999999999879 | 0.8 | -1.441 | -0.567 |
| -1.686999999999879 | 0.786 | -1.434 | -0.566 |
| -1.683999999999879 | 0.772 | -1.427 | -0.565 |
| -1.680999999999879 | 0.758 | -1.419 | -0.564 |
| -1.677999999999879 | 0.745 | -1.412 | -0.563 |
| -1.674999999999879 | 0.731 | -1.405 | -0.562 |
| -1.671999999999879 | 0.717 | -1.398 | -0.561 |
| -1.668999999999879 | 0.704 | -1.392 | -0.56 |
| -1.665999999999879 | 0.69 | -1.385 | -0.559 |
| -1.66299999999988 | 0.677 | -1.378 | -0.558 |
| -1.65999999999988 | 0.663 | -1.371 | -0.557 |
| -1.65699999999988 | 0.65 | -1.365 | -0.557 |
| -1.65399999999988 | 0.637 | -1.358 | -0.556 |
| -1.65099999999988 | 0.623 | -1.352 | -0.555 |
| -1.64799999999988 | 0.61 | -1.346 | -0.554 |
| -1.64499999999988 | 0.597 | -1.339 | -0.553 |
| -1.64199999999988 | 0.584 | -1.333 | -0.552 |
| -1.63899999999988 | 0.571 | -1.327 | -0.551 |
| -1.635999999999881 | 0.558 | -1.321 | -0.55 |
| -1.632999999999881 | 0.545 | -1.315 | -0.549 |
| -1.629999999999881 | 0.532 | -1.309 | -0.548 |
| -1.626999999999881 | 0.519 | -1.303 | -0.547 |
| -1.623999999999881 | 0.507 | -1.297 | -0.546 |
| -1.620999999999881 | 0.494 | -1.292 | -0.545 |
| -1.617999999999881 | 0.481 | -1.286 | -0.544 |
| -1.614999999999881 | 0.468 | -1.28 | -0.543 |
| -1.611999999999881 | 0.456 | -1.275 | -0.543 |
| -1.608999999999882 | 0.443 | -1.269 | -0.542 |
| -1.605999999999882 | 0.431 | -1.264 | -0.541 |
| -1.602999999999882 | 0.418 | -1.258 | -0.54 |
| -1.599999999999882 | 0.405 | -1.253 | -0.539 |
| -1.596999999999882 | 0.393 | -1.247 | -0.538 |
| -1.593999999999882 | 0.381 | -1.242 | -0.537 |
| -1.590999999999882 | 0.368 | -1.237 | -0.536 |
| -1.587999999999882 | 0.356 | -1.232 | -0.535 |
| -1.584999999999882 | 0.343 | -1.227 | -0.535 |
| -1.581999999999883 | 0.331 | -1.222 | -0.534 |
| -1.578999999999883 | 0.319 | -1.216 | -0.533 |
| -1.575999999999883 | 0.306 | -1.211 | -0.532 |
| -1.572999999999883 | 0.294 | -1.207 | -0.531 |
| -1.569999999999883 | 0.282 | -1.202 | -0.53 |
| -1.566999999999883 | 0.27 | -1.197 | -0.529 |
| -1.563999999999883 | 0.257 | -1.192 | -0.528 |
| -1.560999999999883 | 0.245 | -1.187 | -0.528 |
| -1.557999999999883 | 0.233 | -1.182 | -0.527 |
| -1.554999999999884 | 0.221 | -1.178 | -0.526 |
| -1.551999999999884 | 0.209 | -1.173 | -0.525 |
| -1.548999999999884 | 0.197 | -1.169 | -0.524 |
| -1.545999999999884 | 0.185 | -1.164 | -0.523 |
| -1.542999999999884 | 0.172 | -1.159 | -0.523 |
| -1.539999999999884 | 0.16 | -1.155 | -0.522 |
| -1.536999999999884 | 0.148 | -1.151 | -0.521 |
| -1.533999999999884 | 0.136 | -1.146 | -0.52 |
| -1.530999999999884 | 0.124 | -1.142 | -0.519 |
| -1.527999999999885 | 0.112 | -1.137 | -0.518 |
| -1.524999999999885 | 0.1 | -1.133 | -0.518 |
| -1.521999999999885 | 0.088 | -1.129 | -0.517 |
| -1.518999999999885 | 0.076 | -1.125 | -0.516 |
| -1.515999999999885 | 0.064 | -1.12 | -0.515 |
| -1.512999999999885 | 0.052 | -1.116 | -0.514 |
| -1.509999999999885 | 0.04 | -1.112 | -0.514 |
| -1.506999999999885 | 0.028 | -1.108 | -0.513 |
| -1.503999999999885 | 0.016 | -1.104 | -0.512 |
| -1.500999999999886 | 0.004 | -1.1 | -0.511 |
| -1.497999999999886 | -0.008 | -1.096 | -0.51 |
| -1.494999999999886 | -0.02 | -1.092 | -0.509 |
| -1.491999999999886 | -0.032 | -1.088 | -0.509 |
| -1.488999999999886 | -0.044 | -1.084 | -0.508 |
| -1.485999999999886 | -0.056 | -1.08 | -0.507 |
| -1.482999999999886 | -0.068 | -1.076 | -0.506 |
| -1.479999999999886 | -0.08 | -1.073 | -0.506 |
| -1.476999999999886 | -0.092 | -1.069 | -0.505 |
| -1.473999999999886 | -0.104 | -1.065 | -0.504 |
| -1.470999999999887 | -0.116 | -1.061 | -0.503 |
| -1.467999999999887 | -0.128 | -1.058 | -0.502 |
| -1.464999999999887 | -0.14 | -1.054 | -0.502 |
| -1.461999999999887 | -0.152 | -1.05 | -0.501 |
| -1.458999999999887 | -0.164 | -1.047 | -0.5 |
| -1.455999999999887 | -0.176 | -1.043 | -0.499 |
| -1.452999999999887 | -0.189 | -1.04 | -0.499 |
| -1.449999999999887 | -0.201 | -1.036 | -0.498 |
| -1.446999999999887 | -0.213 | -1.033 | -0.497 |
| -1.443999999999888 | -0.225 | -1.029 | -0.496 |
| -1.440999999999888 | -0.237 | -1.026 | -0.496 |
| -1.437999999999888 | -0.249 | -1.022 | -0.495 |
| -1.434999999999888 | -0.261 | -1.019 | -0.494 |
| -1.431999999999888 | -0.274 | -1.015 | -0.493 |
| -1.428999999999888 | -0.286 | -1.012 | -0.493 |
| -1.425999999999888 | -0.298 | -1.009 | -0.492 |
| -1.422999999999888 | -0.31 | -1.005 | -0.491 |
| -1.419999999999888 | -0.323 | -1.002 | -0.49 |
| -1.416999999999889 | -0.335 | -0.999 | -0.49 |
| -1.413999999999889 | -0.347 | -0.996 | -0.489 |
| -1.410999999999889 | -0.36 | -0.992 | -0.488 |
| -1.407999999999889 | -0.372 | -0.989 | -0.487 |
| -1.404999999999889 | -0.385 | -0.986 | -0.487 |
| -1.401999999999889 | -0.397 | -0.983 | -0.486 |
| -1.398999999999889 | -0.41 | -0.98 | -0.485 |
| -1.395999999999889 | -0.422 | -0.977 | -0.485 |
| -1.392999999999889 | -0.435 | -0.974 | -0.484 |
| -1.389999999999889 | -0.447 | -0.971 | -0.483 |
| -1.38699999999989 | -0.46 | -0.967 | -0.482 |
| -1.38399999999989 | -0.473 | -0.964 | -0.482 |
| -1.38099999999989 | -0.485 | -0.961 | -0.481 |
| -1.37799999999989 | -0.498 | -0.958 | -0.48 |
| -1.37499999999989 | -0.511 | -0.956 | -0.48 |
| -1.37199999999989 | -0.524 | -0.953 | -0.479 |
| -1.36899999999989 | -0.537 | -0.95 | -0.478 |
| -1.36599999999989 | -0.549 | -0.947 | -0.477 |
| -1.36299999999989 | -0.562 | -0.944 | -0.477 |
| -1.359999999999891 | -0.575 | -0.941 | -0.476 |
| -1.356999999999891 | -0.588 | -0.938 | -0.475 |
| -1.353999999999891 | -0.602 | -0.935 | -0.475 |
| -1.350999999999891 | -0.615 | -0.932 | -0.474 |
| -1.347999999999891 | -0.628 | -0.93 | -0.473 |
| -1.344999999999891 | -0.641 | -0.927 | -0.473 |
| -1.341999999999891 | -0.654 | -0.924 | -0.472 |
| -1.338999999999891 | -0.668 | -0.921 | -0.471 |
| -1.335999999999891 | -0.681 | -0.919 | -0.471 |
| -1.332999999999892 | -0.695 | -0.916 | -0.47 |
| -1.329999999999892 | -0.708 | -0.913 | -0.469 |
| -1.326999999999892 | -0.722 | -0.911 | -0.469 |
| -1.323999999999892 | -0.735 | -0.908 | -0.468 |
| -1.320999999999892 | -0.749 | -0.905 | -0.467 |
| -1.317999999999892 | -0.763 | -0.903 | -0.467 |
| -1.314999999999892 | -0.777 | -0.9 | -0.466 |
| -1.311999999999892 | -0.791 | -0.898 | -0.465 |
| -1.308999999999892 | -0.805 | -0.895 | -0.465 |
| -1.305999999999893 | -0.819 | -0.892 | -0.464 |
| -1.302999999999893 | -0.833 | -0.89 | -0.463 |
| -1.299999999999893 | -0.847 | -0.887 | -0.463 |
| -1.296999999999893 | -0.862 | -0.885 | -0.462 |
| -1.293999999999893 | -0.876 | -0.882 | -0.461 |
| -1.290999999999893 | -0.891 | -0.88 | -0.461 |
| -1.287999999999893 | -0.905 | -0.877 | -0.46 |
| -1.284999999999893 | -0.92 | -0.875 | -0.459 |
| -1.281999999999893 | -0.935 | -0.872 | -0.459 |
| -1.278999999999894 | -0.949 | -0.87 | -0.458 |
| -1.275999999999894 | -0.964 | -0.868 | -0.457 |
| -1.272999999999894 | -0.979 | -0.865 | -0.457 |
| -1.269999999999894 | -0.995 | -0.863 | -0.456 |
| -1.266999999999894 | -1.01 | -0.86 | -0.456 |
| -1.263999999999894 | -1.025 | -0.858 | -0.455 |
| -1.260999999999894 | -1.041 | -0.856 | -0.454 |
| -1.257999999999894 | -1.056 | -0.853 | -0.454 |
| -1.254999999999894 | -1.072 | -0.851 | -0.453 |
| -1.251999999999895 | -1.088 | -0.849 | -0.452 |
| -1.248999999999895 | -1.104 | -0.847 | -0.452 |
| -1.245999999999895 | -1.12 | -0.844 | -0.451 |
| -1.242999999999895 | -1.136 | -0.842 | -0.451 |
| -1.239999999999895 | -1.153 | -0.84 | -0.45 |
| -1.236999999999895 | -1.169 | -0.838 | -0.449 |
| -1.233999999999895 | -1.186 | -0.835 | -0.449 |
| -1.230999999999895 | -1.203 | -0.833 | -0.448 |
| -1.227999999999895 | -1.22 | -0.831 | -0.447 |
| -1.224999999999895 | -1.237 | -0.829 | -0.447 |
| -1.221999999999896 | -1.254 | -0.827 | -0.446 |
| -1.218999999999896 | -1.272 | -0.824 | -0.446 |
| -1.215999999999896 | -1.289 | -0.822 | -0.445 |
| -1.212999999999896 | -1.307 | -0.82 | -0.444 |
| -1.209999999999896 | -1.325 | -0.818 | -0.444 |
| -1.206999999999896 | -1.343 | -0.816 | -0.443 |
| -1.203999999999896 | -1.361 | -0.814 | -0.443 |
| -1.200999999999896 | -1.38 | -0.812 | -0.442 |
| -1.197999999999896 | -1.399 | -0.81 | -0.441 |
| -1.194999999999897 | -1.418 | -0.807 | -0.441 |
| -1.191999999999897 | -1.437 | -0.805 | -0.44 |
| -1.188999999999897 | -1.457 | -0.803 | -0.44 |
| -1.185999999999897 | -1.476 | -0.801 | -0.439 |
| -1.182999999999897 | -1.496 | -0.799 | -0.438 |
| -1.179999999999897 | -1.516 | -0.797 | -0.438 |
| -1.176999999999897 | -1.537 | -0.795 | -0.437 |
| -1.173999999999897 | -1.558 | -0.793 | -0.437 |
| -1.170999999999897 | -1.579 | -0.791 | -0.436 |
| -1.167999999999898 | -1.6 | -0.789 | -0.436 |
| -1.164999999999898 | -1.621 | -0.787 | -0.435 |
| -1.161999999999898 | -1.643 | -0.785 | -0.434 |
| -1.158999999999898 | -1.666 | -0.783 | -0.434 |
| -1.155999999999898 | -1.688 | -0.782 | -0.433 |
| -1.152999999999898 | -1.711 | -0.78 | -0.433 |
| -1.149999999999898 | -1.735 | -0.778 | -0.432 |
| -1.146999999999898 | -1.758 | -0.776 | -0.432 |
| -1.143999999999898 | -1.782 | -0.774 | -0.431 |
| -1.140999999999899 | -1.807 | -0.772 | -0.43 |
| -1.137999999999899 | -1.832 | -0.77 | -0.43 |
| -1.134999999999899 | -1.857 | -0.768 | -0.429 |
| -1.131999999999899 | -1.883 | -0.766 | -0.429 |
| -1.128999999999899 | -1.91 | -0.765 | -0.428 |
| -1.125999999999899 | -1.937 | -0.763 | -0.428 |
| -1.122999999999899 | -1.964 | -0.761 | -0.427 |
| -1.119999999999899 | -1.992 | -0.759 | -0.427 |
| -1.116999999999899 | -2.021 | -0.757 | -0.426 |
| -1.1139999999999 | -2.051 | -0.755 | -0.425 |
| -1.1109999999999 | -2.081 | -0.754 | -0.425 |
| -1.1079999999999 | -2.111 | -0.752 | -0.424 |
| -1.1049999999999 | -2.143 | -0.75 | -0.424 |
| -1.1019999999999 | -2.175 | -0.748 | -0.423 |
| -1.0989999999999 | -2.208 | -0.747 | -0.423 |
| -1.0959999999999 | -2.242 | -0.745 | -0.422 |
| -1.0929999999999 | -2.278 | -0.743 | -0.422 |
| -1.0899999999999 | -2.314 | -0.741 | -0.421 |
| -1.0869999999999 | -2.351 | -0.74 | -0.421 |
| -1.083999999999901 | -2.389 | -0.738 | -0.42 |
| -1.080999999999901 | -2.429 | -0.736 | -0.419 |
| -1.077999999999901 | -2.47 | -0.735 | -0.419 |
| -1.074999999999901 | -2.512 | -0.733 | -0.418 |
| -1.071999999999901 | -2.556 | -0.731 | -0.418 |
| -1.068999999999901 | -2.602 | -0.73 | -0.417 |
| -1.065999999999901 | -2.65 | -0.728 | -0.417 |
| -1.062999999999901 | -2.7 | -0.726 | -0.416 |
| -1.059999999999901 | -2.752 | -0.725 | -0.416 |
| -1.056999999999902 | -2.806 | -0.723 | -0.415 |
| -1.053999999999902 | -2.863 | -0.721 | -0.415 |
| -1.050999999999902 | -2.924 | -0.72 | -0.414 |
| -1.047999999999902 | -2.987 | -0.718 | -0.414 |
| -1.044999999999902 | -3.055 | -0.716 | -0.413 |
| -1.041999999999902 | -3.127 | -0.715 | -0.413 |
| -1.038999999999902 | -3.204 | -0.713 | -0.412 |
| -1.035999999999902 | -3.288 | -0.712 | -0.412 |
| -1.032999999999902 | -3.378 | -0.71 | -0.411 |
| -1.029999999999903 | -3.476 | -0.708 | -0.411 |
| -1.026999999999903 | -3.585 | -0.707 | -0.41 |
| -1.023999999999903 | -3.705 | -0.705 | -0.41 |
| -1.020999999999903 | -3.842 | -0.704 | -0.409 |
| -1.017999999999903 | -3.999 | -0.702 | -0.408 |
| -1.014999999999903 | -4.185 | -0.701 | -0.408 |
| -1.011999999999903 | -4.411 | -0.699 | -0.407 |
| -1.008999999999903 | -4.701 | -0.698 | -0.407 |
| -1.005999999999903 | -5.11 | -0.696 | -0.406 |
| -1.002999999999904 | -5.806 | -0.695 | -0.406 |
| -0.999999999999903 | -29.969 | -0.693 | -0.405 |
| -0.996999999999903 | -5.812 | -0.692 | -0.405 |
| -0.993999999999903 | -5.122 | -0.69 | -0.404 |
| -0.990999999999903 | -4.719 | -0.689 | -0.404 |
| -0.987999999999903 | -4.435 | -0.687 | -0.403 |
| -0.984999999999903 | -4.215 | -0.686 | -0.403 |
| -0.981999999999903 | -4.035 | -0.684 | -0.402 |
| -0.978999999999903 | -3.884 | -0.683 | -0.402 |
| -0.975999999999903 | -3.753 | -0.681 | -0.402 |
| -0.972999999999903 | -3.639 | -0.68 | -0.401 |
| -0.969999999999903 | -3.536 | -0.678 | -0.401 |
| -0.966999999999903 | -3.444 | -0.677 | -0.4 |
| -0.963999999999903 | -3.36 | -0.676 | -0.4 |
| -0.960999999999903 | -3.282 | -0.674 | -0.399 |
| -0.957999999999903 | -3.211 | -0.673 | -0.399 |
| -0.954999999999903 | -3.145 | -0.671 | -0.398 |
| -0.951999999999903 | -3.083 | -0.67 | -0.398 |
| -0.948999999999903 | -3.026 | -0.669 | -0.397 |
| -0.945999999999903 | -2.971 | -0.667 | -0.397 |
| -0.942999999999903 | -2.92 | -0.666 | -0.396 |
| -0.939999999999903 | -2.872 | -0.664 | -0.396 |
| -0.936999999999903 | -2.826 | -0.663 | -0.395 |
| -0.933999999999903 | -2.782 | -0.662 | -0.395 |
| -0.930999999999903 | -2.74 | -0.66 | -0.394 |
| -0.927999999999903 | -2.701 | -0.659 | -0.394 |
| -0.924999999999903 | -2.663 | -0.658 | -0.393 |
| -0.921999999999903 | -2.626 | -0.656 | -0.393 |
| -0.918999999999903 | -2.591 | -0.655 | -0.392 |
| -0.915999999999903 | -2.558 | -0.654 | -0.392 |
| -0.912999999999903 | -2.525 | -0.652 | -0.391 |
| -0.909999999999903 | -2.494 | -0.651 | -0.391 |
| -0.906999999999903 | -2.464 | -0.65 | -0.391 |
| -0.903999999999903 | -2.435 | -0.648 | -0.39 |
| -0.900999999999903 | -2.407 | -0.647 | -0.39 |
| -0.897999999999903 | -2.38 | -0.646 | -0.389 |
| -0.894999999999903 | -2.354 | -0.644 | -0.389 |
| -0.891999999999903 | -2.328 | -0.643 | -0.388 |
| -0.888999999999903 | -2.303 | -0.642 | -0.388 |
| -0.885999999999903 | -2.28 | -0.641 | -0.387 |
| -0.882999999999903 | -2.256 | -0.639 | -0.387 |
| -0.879999999999903 | -2.234 | -0.638 | -0.386 |
| -0.876999999999903 | -2.212 | -0.637 | -0.386 |
| -0.873999999999903 | -2.19 | -0.636 | -0.386 |
| -0.870999999999903 | -2.169 | -0.634 | -0.385 |
| -0.867999999999903 | -2.149 | -0.633 | -0.385 |
| -0.864999999999903 | -2.129 | -0.632 | -0.384 |
| -0.861999999999903 | -2.11 | -0.631 | -0.384 |
| -0.858999999999903 | -2.091 | -0.629 | -0.383 |
| -0.855999999999903 | -2.072 | -0.628 | -0.383 |
| -0.852999999999903 | -2.054 | -0.627 | -0.382 |
| -0.849999999999903 | -2.037 | -0.626 | -0.382 |
| -0.846999999999903 | -2.02 | -0.624 | -0.381 |
| -0.843999999999903 | -2.003 | -0.623 | -0.381 |
| -0.840999999999903 | -1.986 | -0.622 | -0.381 |
| -0.837999999999903 | -1.97 | -0.621 | -0.38 |
| -0.834999999999903 | -1.955 | -0.62 | -0.38 |
| -0.831999999999903 | -1.939 | -0.619 | -0.379 |
| -0.828999999999903 | -1.924 | -0.617 | -0.379 |
| -0.825999999999903 | -1.909 | -0.616 | -0.378 |
| -0.822999999999903 | -1.895 | -0.615 | -0.378 |
| -0.819999999999903 | -1.88 | -0.614 | -0.378 |
| -0.816999999999903 | -1.866 | -0.613 | -0.377 |
| -0.813999999999903 | -1.853 | -0.611 | -0.377 |
| -0.810999999999903 | -1.839 | -0.61 | -0.376 |
| -0.807999999999903 | -1.826 | -0.609 | -0.376 |
| -0.804999999999903 | -1.813 | -0.608 | -0.375 |
| -0.801999999999903 | -1.8 | -0.607 | -0.375 |
| -0.798999999999903 | -1.788 | -0.606 | -0.375 |
| -0.795999999999903 | -1.775 | -0.605 | -0.374 |
| -0.792999999999903 | -1.763 | -0.603 | -0.374 |
| -0.789999999999903 | -1.751 | -0.602 | -0.373 |
| -0.786999999999903 | -1.74 | -0.601 | -0.373 |
| -0.783999999999903 | -1.728 | -0.6 | -0.372 |
| -0.780999999999903 | -1.717 | -0.599 | -0.372 |
| -0.777999999999903 | -1.706 | -0.598 | -0.372 |
| -0.774999999999903 | -1.695 | -0.597 | -0.371 |
| -0.771999999999903 | -1.684 | -0.596 | -0.371 |
| -0.768999999999903 | -1.673 | -0.595 | -0.37 |
| -0.765999999999903 | -1.663 | -0.594 | -0.37 |
| -0.762999999999903 | -1.652 | -0.592 | -0.37 |
| -0.759999999999903 | -1.642 | -0.591 | -0.369 |
| -0.756999999999903 | -1.632 | -0.59 | -0.369 |
| -0.753999999999903 | -1.622 | -0.589 | -0.368 |
| -0.750999999999903 | -1.613 | -0.588 | -0.368 |
| -0.747999999999903 | -1.603 | -0.587 | -0.367 |
| -0.744999999999903 | -1.594 | -0.586 | -0.367 |
| -0.741999999999903 | -1.584 | -0.585 | -0.367 |
| -0.738999999999903 | -1.575 | -0.584 | -0.366 |
| -0.735999999999903 | -1.566 | -0.583 | -0.366 |
| -0.732999999999903 | -1.557 | -0.582 | -0.365 |
| -0.729999999999903 | -1.548 | -0.581 | -0.365 |
| -0.726999999999903 | -1.54 | -0.58 | -0.365 |
| -0.723999999999903 | -1.531 | -0.579 | -0.364 |
| -0.720999999999903 | -1.523 | -0.578 | -0.364 |
| -0.717999999999903 | -1.514 | -0.577 | -0.363 |
| -0.714999999999903 | -1.506 | -0.576 | -0.363 |
| -0.711999999999903 | -1.498 | -0.575 | -0.363 |
| -0.708999999999903 | -1.49 | -0.574 | -0.362 |
| -0.705999999999903 | -1.482 | -0.573 | -0.362 |
| -0.702999999999903 | -1.474 | -0.572 | -0.361 |
| -0.699999999999903 | -1.466 | -0.571 | -0.361 |
| -0.696999999999903 | -1.459 | -0.57 | -0.361 |
| -0.693999999999903 | -1.451 | -0.569 | -0.36 |
| -0.690999999999903 | -1.444 | -0.568 | -0.36 |
| -0.687999999999903 | -1.436 | -0.567 | -0.359 |
| -0.684999999999903 | -1.429 | -0.566 | -0.359 |
| -0.681999999999903 | -1.422 | -0.565 | -0.359 |
| -0.678999999999903 | -1.415 | -0.564 | -0.358 |
| -0.675999999999903 | -1.408 | -0.563 | -0.358 |
| -0.672999999999903 | -1.401 | -0.562 | -0.357 |
| -0.669999999999903 | -1.394 | -0.561 | -0.357 |
| -0.666999999999903 | -1.387 | -0.56 | -0.357 |
| -0.663999999999903 | -1.38 | -0.559 | -0.356 |
| -0.660999999999903 | -1.374 | -0.558 | -0.356 |
| -0.657999999999903 | -1.367 | -0.557 | -0.356 |
| -0.654999999999903 | -1.361 | -0.556 | -0.355 |
| -0.651999999999903 | -1.354 | -0.555 | -0.355 |
| -0.648999999999903 | -1.348 | -0.554 | -0.354 |
| -0.645999999999903 | -1.342 | -0.553 | -0.354 |
| -0.642999999999903 | -1.335 | -0.552 | -0.354 |
| -0.639999999999903 | -1.329 | -0.551 | -0.353 |
| -0.636999999999903 | -1.323 | -0.55 | -0.353 |
| -0.633999999999903 | -1.317 | -0.549 | -0.353 |
| -0.630999999999903 | -1.311 | -0.548 | -0.352 |
| -0.627999999999903 | -1.305 | -0.547 | -0.352 |
| -0.624999999999903 | -1.299 | -0.547 | -0.351 |
| -0.621999999999903 | -1.293 | -0.546 | -0.351 |
| -0.618999999999903 | -1.288 | -0.545 | -0.351 |
| -0.615999999999903 | -1.282 | -0.544 | -0.35 |
| -0.612999999999903 | -1.276 | -0.543 | -0.35 |
| -0.609999999999903 | -1.271 | -0.542 | -0.35 |
| -0.606999999999903 | -1.265 | -0.541 | -0.349 |
| -0.603999999999903 | -1.26 | -0.54 | -0.349 |
| -0.600999999999903 | -1.255 | -0.539 | -0.348 |
| -0.597999999999903 | -1.249 | -0.538 | -0.348 |
| -0.594999999999903 | -1.244 | -0.538 | -0.348 |
| -0.591999999999903 | -1.239 | -0.537 | -0.347 |
| -0.588999999999903 | -1.233 | -0.536 | -0.347 |
| -0.585999999999903 | -1.228 | -0.535 | -0.347 |
| -0.582999999999903 | -1.223 | -0.534 | -0.346 |
| -0.579999999999903 | -1.218 | -0.533 | -0.346 |
| -0.576999999999903 | -1.213 | -0.532 | -0.346 |
| -0.573999999999903 | -1.208 | -0.531 | -0.345 |
| -0.570999999999903 | -1.203 | -0.531 | -0.345 |
| -0.567999999999903 | -1.198 | -0.53 | -0.344 |
| -0.564999999999903 | -1.194 | -0.529 | -0.344 |
| -0.561999999999903 | -1.189 | -0.528 | -0.344 |
| -0.558999999999903 | -1.184 | -0.527 | -0.343 |
| -0.555999999999903 | -1.179 | -0.526 | -0.343 |
| -0.552999999999903 | -1.175 | -0.525 | -0.343 |
| -0.549999999999903 | -1.17 | -0.525 | -0.342 |
| -0.546999999999903 | -1.165 | -0.524 | -0.342 |
| -0.543999999999903 | -1.161 | -0.523 | -0.342 |
| -0.540999999999903 | -1.156 | -0.522 | -0.341 |
| -0.537999999999903 | -1.152 | -0.521 | -0.341 |
| -0.534999999999903 | -1.148 | -0.52 | -0.341 |
| -0.531999999999903 | -1.143 | -0.52 | -0.34 |
| -0.528999999999903 | -1.139 | -0.519 | -0.34 |
| -0.525999999999903 | -1.135 | -0.518 | -0.339 |
| -0.522999999999903 | -1.13 | -0.517 | -0.339 |
| -0.519999999999903 | -1.126 | -0.516 | -0.339 |
| -0.516999999999903 | -1.122 | -0.515 | -0.338 |
| -0.513999999999903 | -1.118 | -0.515 | -0.338 |
| -0.510999999999903 | -1.113 | -0.514 | -0.338 |
| -0.507999999999903 | -1.109 | -0.513 | -0.337 |
| -0.504999999999903 | -1.105 | -0.512 | -0.337 |
| -0.501999999999903 | -1.101 | -0.511 | -0.337 |
| -0.498999999999903 | -1.097 | -0.511 | -0.336 |
| -0.495999999999903 | -1.093 | -0.51 | -0.336 |
| -0.492999999999903 | -1.089 | -0.509 | -0.336 |
| -0.489999999999903 | -1.085 | -0.508 | -0.335 |
| -0.486999999999903 | -1.082 | -0.507 | -0.335 |
| -0.483999999999903 | -1.078 | -0.507 | -0.335 |
| -0.480999999999903 | -1.074 | -0.506 | -0.334 |
| -0.477999999999903 | -1.07 | -0.505 | -0.334 |
| -0.474999999999903 | -1.066 | -0.504 | -0.334 |
| -0.471999999999903 | -1.063 | -0.503 | -0.333 |
| -0.468999999999903 | -1.059 | -0.503 | -0.333 |
| -0.465999999999903 | -1.055 | -0.502 | -0.333 |
| -0.462999999999903 | -1.052 | -0.501 | -0.332 |
| -0.459999999999903 | -1.048 | -0.5 | -0.332 |
| -0.456999999999903 | -1.044 | -0.5 | -0.332 |
| -0.453999999999903 | -1.041 | -0.499 | -0.331 |
| -0.450999999999903 | -1.037 | -0.498 | -0.331 |
| -0.447999999999903 | -1.034 | -0.497 | -0.331 |
| -0.444999999999903 | -1.03 | -0.497 | -0.33 |
| -0.441999999999903 | -1.027 | -0.496 | -0.33 |
| -0.438999999999903 | -1.023 | -0.495 | -0.33 |
| -0.435999999999903 | -1.02 | -0.494 | -0.329 |
| -0.432999999999903 | -1.017 | -0.494 | -0.329 |
| -0.429999999999903 | -1.013 | -0.493 | -0.329 |
| -0.426999999999903 | -1.01 | -0.492 | -0.328 |
| -0.423999999999903 | -1.007 | -0.491 | -0.328 |
| -0.420999999999903 | -1.003 | -0.491 | -0.328 |
| -0.417999999999903 | -1 | -0.49 | -0.327 |
| -0.414999999999903 | -0.997 | -0.489 | -0.327 |
| -0.411999999999903 | -0.994 | -0.488 | -0.327 |
| -0.408999999999903 | -0.99 | -0.488 | -0.326 |
| -0.405999999999903 | -0.987 | -0.487 | -0.326 |
| -0.402999999999903 | -0.984 | -0.486 | -0.326 |
| -0.399999999999903 | -0.981 | -0.486 | -0.325 |
| -0.396999999999903 | -0.978 | -0.485 | -0.325 |
| -0.393999999999903 | -0.975 | -0.484 | -0.325 |
| -0.390999999999903 | -0.972 | -0.483 | -0.324 |
| -0.387999999999903 | -0.968 | -0.483 | -0.324 |
| -0.384999999999903 | -0.965 | -0.482 | -0.324 |
| -0.381999999999903 | -0.962 | -0.481 | -0.324 |
| -0.378999999999903 | -0.959 | -0.481 | -0.323 |
| -0.375999999999903 | -0.956 | -0.48 | -0.323 |
| -0.372999999999903 | -0.954 | -0.479 | -0.323 |
| -0.369999999999903 | -0.951 | -0.478 | -0.322 |
| -0.366999999999903 | -0.948 | -0.478 | -0.322 |
| -0.363999999999903 | -0.945 | -0.477 | -0.322 |
| -0.360999999999903 | -0.942 | -0.476 | -0.321 |
| -0.357999999999903 | -0.939 | -0.476 | -0.321 |
| -0.354999999999903 | -0.936 | -0.475 | -0.321 |
| -0.351999999999903 | -0.933 | -0.474 | -0.32 |
| -0.348999999999903 | -0.931 | -0.474 | -0.32 |
| -0.345999999999903 | -0.928 | -0.473 | -0.32 |
| -0.342999999999903 | -0.925 | -0.472 | -0.319 |
| -0.339999999999903 | -0.922 | -0.472 | -0.319 |
| -0.336999999999903 | -0.92 | -0.471 | -0.319 |
| -0.333999999999903 | -0.917 | -0.47 | -0.319 |
| -0.330999999999903 | -0.914 | -0.469 | -0.318 |
| -0.327999999999903 | -0.912 | -0.469 | -0.318 |
| -0.324999999999903 | -0.909 | -0.468 | -0.318 |
| -0.321999999999903 | -0.906 | -0.467 | -0.317 |
| -0.318999999999903 | -0.904 | -0.467 | -0.317 |
| -0.315999999999903 | -0.901 | -0.466 | -0.317 |
| -0.312999999999903 | -0.898 | -0.465 | -0.316 |
| -0.309999999999903 | -0.896 | -0.465 | -0.316 |
| -0.306999999999903 | -0.893 | -0.464 | -0.316 |
| -0.303999999999903 | -0.891 | -0.463 | -0.315 |
| -0.300999999999903 | -0.888 | -0.463 | -0.315 |
| -0.297999999999903 | -0.886 | -0.462 | -0.315 |
| -0.294999999999903 | -0.883 | -0.462 | -0.315 |
| -0.291999999999903 | -0.881 | -0.461 | -0.314 |
| -0.288999999999903 | -0.878 | -0.46 | -0.314 |
| -0.285999999999903 | -0.876 | -0.46 | -0.314 |
| -0.282999999999903 | -0.873 | -0.459 | -0.313 |
| -0.279999999999903 | -0.871 | -0.458 | -0.313 |
| -0.276999999999903 | -0.868 | -0.458 | -0.313 |
| -0.273999999999903 | -0.866 | -0.457 | -0.312 |
| -0.270999999999903 | -0.864 | -0.456 | -0.312 |
| -0.267999999999903 | -0.861 | -0.456 | -0.312 |
| -0.264999999999903 | -0.859 | -0.455 | -0.312 |
| -0.261999999999903 | -0.857 | -0.454 | -0.311 |
| -0.258999999999903 | -0.854 | -0.454 | -0.311 |
| -0.255999999999903 | -0.852 | -0.453 | -0.311 |
| -0.252999999999903 | -0.85 | -0.453 | -0.31 |
| -0.249999999999903 | -0.847 | -0.452 | -0.31 |
| -0.246999999999903 | -0.845 | -0.451 | -0.31 |
| -0.243999999999903 | -0.843 | -0.451 | -0.31 |
| -0.240999999999903 | -0.84 | -0.45 | -0.309 |
| -0.237999999999903 | -0.838 | -0.45 | -0.309 |
| -0.234999999999903 | -0.836 | -0.449 | -0.309 |
| -0.231999999999903 | -0.834 | -0.448 | -0.308 |
| -0.228999999999903 | -0.832 | -0.448 | -0.308 |
| -0.225999999999903 | -0.829 | -0.447 | -0.308 |
| -0.222999999999903 | -0.827 | -0.446 | -0.308 |
| -0.219999999999903 | -0.825 | -0.446 | -0.307 |
| -0.216999999999903 | -0.823 | -0.445 | -0.307 |
| -0.213999999999903 | -0.821 | -0.445 | -0.307 |
| -0.210999999999903 | -0.819 | -0.444 | -0.306 |
| -0.207999999999903 | -0.817 | -0.443 | -0.306 |
| -0.204999999999903 | -0.814 | -0.443 | -0.306 |
| -0.201999999999903 | -0.812 | -0.442 | -0.306 |
| -0.198999999999903 | -0.81 | -0.442 | -0.305 |
| -0.195999999999903 | -0.808 | -0.441 | -0.305 |
| -0.192999999999903 | -0.806 | -0.44 | -0.305 |
| -0.189999999999903 | -0.804 | -0.44 | -0.304 |
| -0.186999999999903 | -0.802 | -0.439 | -0.304 |
| -0.183999999999903 | -0.8 | -0.439 | -0.304 |
| -0.180999999999903 | -0.798 | -0.438 | -0.304 |
| -0.177999999999903 | -0.796 | -0.438 | -0.303 |
| -0.174999999999903 | -0.794 | -0.437 | -0.303 |
| -0.171999999999903 | -0.792 | -0.436 | -0.303 |
| -0.168999999999903 | -0.79 | -0.436 | -0.302 |
| -0.165999999999903 | -0.788 | -0.435 | -0.302 |
| -0.162999999999903 | -0.786 | -0.435 | -0.302 |
| -0.159999999999903 | -0.784 | -0.434 | -0.302 |
| -0.156999999999903 | -0.782 | -0.433 | -0.301 |
| -0.153999999999903 | -0.78 | -0.433 | -0.301 |
| -0.150999999999903 | -0.778 | -0.432 | -0.301 |
| -0.147999999999903 | -0.776 | -0.432 | -0.301 |
| -0.144999999999903 | -0.775 | -0.431 | -0.3 |
| -0.141999999999903 | -0.773 | -0.431 | -0.3 |
| -0.138999999999903 | -0.771 | -0.43 | -0.3 |
| -0.135999999999903 | -0.769 | -0.429 | -0.299 |
| -0.132999999999903 | -0.767 | -0.429 | -0.299 |
| -0.129999999999903 | -0.765 | -0.428 | -0.299 |
| -0.126999999999903 | -0.763 | -0.428 | -0.299 |
| -0.123999999999903 | -0.762 | -0.427 | -0.298 |
| -0.120999999999903 | -0.76 | -0.427 | -0.298 |
| -0.117999999999903 | -0.758 | -0.426 | -0.298 |
| -0.114999999999903 | -0.756 | -0.426 | -0.298 |
| -0.111999999999903 | -0.754 | -0.425 | -0.297 |
| -0.108999999999903 | -0.753 | -0.424 | -0.297 |
| -0.105999999999903 | -0.751 | -0.424 | -0.297 |
| -0.102999999999903 | -0.749 | -0.423 | -0.297 |
| -0.0999999999999027 | -0.747 | -0.423 | -0.296 |
| -0.0969999999999027 | -0.745 | -0.422 | -0.296 |
| -0.0939999999999027 | -0.744 | -0.422 | -0.296 |
| -0.0909999999999027 | -0.742 | -0.421 | -0.295 |
| -0.0879999999999027 | -0.74 | -0.421 | -0.295 |
| -0.0849999999999027 | -0.739 | -0.42 | -0.295 |
| -0.0819999999999027 | -0.737 | -0.42 | -0.295 |
| -0.0789999999999027 | -0.735 | -0.419 | -0.294 |
| -0.0759999999999027 | -0.733 | -0.419 | -0.294 |
| -0.0729999999999027 | -0.732 | -0.418 | -0.294 |
| -0.0699999999999027 | -0.73 | -0.417 | -0.294 |
| -0.0669999999999027 | -0.728 | -0.417 | -0.293 |
| -0.0639999999999027 | -0.727 | -0.416 | -0.293 |
| -0.0609999999999027 | -0.725 | -0.416 | -0.293 |
| -0.0579999999999027 | -0.723 | -0.415 | -0.293 |
| -0.0549999999999027 | -0.722 | -0.415 | -0.292 |
| -0.0519999999999027 | -0.72 | -0.414 | -0.292 |
| -0.0489999999999027 | -0.719 | -0.414 | -0.292 |
| -0.0459999999999027 | -0.717 | -0.413 | -0.292 |
| -0.0429999999999027 | -0.715 | -0.413 | -0.291 |
| -0.0399999999999027 | -0.714 | -0.412 | -0.291 |
| -0.0369999999999027 | -0.712 | -0.412 | -0.291 |
| -0.0339999999999027 | -0.711 | -0.411 | -0.291 |
| -0.0309999999999027 | -0.709 | -0.411 | -0.29 |
| -0.0279999999999027 | -0.707 | -0.41 | -0.29 |
| -0.0249999999999027 | -0.706 | -0.41 | -0.29 |
| -0.0219999999999027 | -0.704 | -0.409 | -0.29 |
| -0.0189999999999027 | -0.703 | -0.409 | -0.289 |
| -0.0159999999999027 | -0.701 | -0.408 | -0.289 |
| -0.0129999999999027 | -0.7 | -0.408 | -0.289 |
| -0.00999999999990267 | -0.698 | -0.407 | -0.289 |
| -0.00699999999990267 | -0.697 | -0.407 | -0.288 |
| -0.00399999999990267 | -0.695 | -0.406 | -0.288 |
| -0.00099999999990267 | -0.694 | -0.406 | -0.288 |
| 0.00200000000009733 | -0.692 | -0.405 | -0.288 |
| 0.00500000000009733 | -0.691 | -0.405 | -0.287 |
| 0.00800000000009733 | -0.689 | -0.404 | -0.287 |
| 0.0110000000000973 | -0.688 | -0.404 | -0.287 |
| 0.0140000000000973 | -0.686 | -0.403 | -0.287 |
| 0.0170000000000973 | -0.685 | -0.403 | -0.286 |
| 0.0200000000000973 | -0.683 | -0.402 | -0.286 |
| 0.0230000000000973 | -0.682 | -0.402 | -0.286 |
| 0.0260000000000973 | -0.68 | -0.401 | -0.286 |
| 0.0290000000000973 | -0.679 | -0.401 | -0.285 |
| 0.0320000000000973 | -0.678 | -0.4 | -0.285 |
| 0.0350000000000973 | -0.676 | -0.4 | -0.285 |
| 0.0380000000000973 | -0.675 | -0.399 | -0.285 |
| 0.0410000000000973 | -0.673 | -0.399 | -0.284 |
| 0.0440000000000973 | -0.672 | -0.398 | -0.284 |
| 0.0470000000000973 | -0.67 | -0.398 | -0.284 |
| 0.0500000000000973 | -0.669 | -0.397 | -0.284 |
| 0.0530000000000973 | -0.668 | -0.397 | -0.283 |
| 0.0560000000000973 | -0.666 | -0.396 | -0.283 |
| 0.0590000000000973 | -0.665 | -0.396 | -0.283 |
| 0.0620000000000973 | -0.664 | -0.395 | -0.283 |
| 0.0650000000000973 | -0.662 | -0.395 | -0.282 |
| 0.0680000000000973 | -0.661 | -0.394 | -0.282 |
| 0.0710000000000974 | -0.659 | -0.394 | -0.282 |
| 0.0740000000000974 | -0.658 | -0.394 | -0.282 |
| 0.0770000000000974 | -0.657 | -0.393 | -0.281 |
| 0.0800000000000974 | -0.655 | -0.393 | -0.281 |
| 0.0830000000000974 | -0.654 | -0.392 | -0.281 |
| 0.0860000000000974 | -0.653 | -0.392 | -0.281 |
| 0.0890000000000974 | -0.651 | -0.391 | -0.28 |
| 0.0920000000000974 | -0.65 | -0.391 | -0.28 |
| 0.0950000000000974 | -0.649 | -0.39 | -0.28 |
| 0.0980000000000974 | -0.647 | -0.39 | -0.28 |
| 0.101000000000097 | -0.646 | -0.389 | -0.28 |
| 0.104000000000097 | -0.645 | -0.389 | -0.279 |
| 0.107000000000097 | -0.644 | -0.388 | -0.279 |
| 0.110000000000097 | -0.642 | -0.388 | -0.279 |
| 0.113000000000097 | -0.641 | -0.387 | -0.279 |
| 0.116000000000097 | -0.64 | -0.387 | -0.278 |
| 0.119000000000097 | -0.639 | -0.387 | -0.278 |
| 0.122000000000097 | -0.637 | -0.386 | -0.278 |
| 0.125000000000097 | -0.636 | -0.386 | -0.278 |
| 0.128000000000097 | -0.635 | -0.385 | -0.277 |
| 0.131000000000097 | -0.633 | -0.385 | -0.277 |
| 0.134000000000097 | -0.632 | -0.384 | -0.277 |
| 0.137000000000097 | -0.631 | -0.384 | -0.277 |
| 0.140000000000097 | -0.63 | -0.383 | -0.276 |
| 0.143000000000097 | -0.629 | -0.383 | -0.276 |
| 0.146000000000097 | -0.627 | -0.383 | -0.276 |
| 0.149000000000097 | -0.626 | -0.382 | -0.276 |
| 0.152000000000097 | -0.625 | -0.382 | -0.276 |
| 0.155000000000097 | -0.624 | -0.381 | -0.275 |
| 0.158000000000097 | -0.622 | -0.381 | -0.275 |
| 0.161000000000097 | -0.621 | -0.38 | -0.275 |
| 0.164000000000097 | -0.62 | -0.38 | -0.275 |
| 0.167000000000097 | -0.619 | -0.379 | -0.274 |
| 0.170000000000097 | -0.618 | -0.379 | -0.274 |
| 0.173000000000097 | -0.617 | -0.379 | -0.274 |
| 0.176000000000097 | -0.615 | -0.378 | -0.274 |
| 0.179000000000097 | -0.614 | -0.378 | -0.274 |
| 0.182000000000097 | -0.613 | -0.377 | -0.273 |
| 0.185000000000097 | -0.612 | -0.377 | -0.273 |
| 0.188000000000097 | -0.611 | -0.376 | -0.273 |
| 0.191000000000097 | -0.61 | -0.376 | -0.273 |
| 0.194000000000097 | -0.608 | -0.376 | -0.272 |
| 0.197000000000097 | -0.607 | -0.375 | -0.272 |
| 0.200000000000097 | -0.606 | -0.375 | -0.272 |
| 0.203000000000097 | -0.605 | -0.374 | -0.272 |
| 0.206000000000097 | -0.604 | -0.374 | -0.271 |
| 0.209000000000097 | -0.603 | -0.373 | -0.271 |
| 0.212000000000097 | -0.602 | -0.373 | -0.271 |
| 0.215000000000097 | -0.601 | -0.373 | -0.271 |
| 0.218000000000097 | -0.599 | -0.372 | -0.271 |
| 0.221000000000097 | -0.598 | -0.372 | -0.27 |
| 0.224000000000097 | -0.597 | -0.371 | -0.27 |
| 0.227000000000097 | -0.596 | -0.371 | -0.27 |
| 0.230000000000097 | -0.595 | -0.37 | -0.27 |
| 0.233000000000097 | -0.594 | -0.37 | -0.27 |
| 0.236000000000097 | -0.593 | -0.37 | -0.269 |
| 0.239000000000097 | -0.592 | -0.369 | -0.269 |
| 0.242000000000097 | -0.591 | -0.369 | -0.269 |
| 0.245000000000097 | -0.59 | -0.368 | -0.269 |
| 0.248000000000097 | -0.588 | -0.368 | -0.268 |
| 0.251000000000097 | -0.587 | -0.368 | -0.268 |
| 0.254000000000097 | -0.586 | -0.367 | -0.268 |
| 0.257000000000097 | -0.585 | -0.367 | -0.268 |
| 0.260000000000097 | -0.584 | -0.366 | -0.268 |
| 0.263000000000097 | -0.583 | -0.366 | -0.267 |
| 0.266000000000097 | -0.582 | -0.366 | -0.267 |
| 0.269000000000097 | -0.581 | -0.365 | -0.267 |
| 0.272000000000097 | -0.58 | -0.365 | -0.267 |
| 0.275000000000097 | -0.579 | -0.364 | -0.266 |
| 0.278000000000097 | -0.578 | -0.364 | -0.266 |
| 0.281000000000097 | -0.577 | -0.364 | -0.266 |
| 0.284000000000097 | -0.576 | -0.363 | -0.266 |
| 0.287000000000097 | -0.575 | -0.363 | -0.266 |
| 0.290000000000097 | -0.574 | -0.362 | -0.265 |
| 0.293000000000097 | -0.573 | -0.362 | -0.265 |
| 0.296000000000097 | -0.572 | -0.362 | -0.265 |
| 0.299000000000097 | -0.571 | -0.361 | -0.265 |
| 0.302000000000097 | -0.57 | -0.361 | -0.265 |
| 0.305000000000097 | -0.569 | -0.36 | -0.264 |
| 0.308000000000097 | -0.568 | -0.36 | -0.264 |
| 0.311000000000097 | -0.567 | -0.36 | -0.264 |
| 0.314000000000097 | -0.566 | -0.359 | -0.264 |
| 0.317000000000097 | -0.565 | -0.359 | -0.263 |
| 0.320000000000097 | -0.564 | -0.358 | -0.263 |
| 0.323000000000097 | -0.563 | -0.358 | -0.263 |
| 0.326000000000097 | -0.562 | -0.358 | -0.263 |
| 0.329000000000097 | -0.561 | -0.357 | -0.263 |
| 0.332000000000097 | -0.56 | -0.357 | -0.262 |
| 0.335000000000098 | -0.559 | -0.356 | -0.262 |
| 0.338000000000098 | -0.558 | -0.356 | -0.262 |
| 0.341000000000098 | -0.557 | -0.356 | -0.262 |
| 0.344000000000098 | -0.556 | -0.355 | -0.262 |
| 0.347000000000098 | -0.555 | -0.355 | -0.261 |
| 0.350000000000098 | -0.554 | -0.355 | -0.261 |
| 0.353000000000098 | -0.553 | -0.354 | -0.261 |
| 0.356000000000098 | -0.552 | -0.354 | -0.261 |
| 0.359000000000098 | -0.551 | -0.353 | -0.261 |
| 0.362000000000098 | -0.551 | -0.353 | -0.26 |
| 0.365000000000098 | -0.55 | -0.353 | -0.26 |
| 0.368000000000098 | -0.549 | -0.352 | -0.26 |
| 0.371000000000098 | -0.548 | -0.352 | -0.26 |
| 0.374000000000098 | -0.547 | -0.352 | -0.26 |
| 0.377000000000098 | -0.546 | -0.351 | -0.259 |
| 0.380000000000098 | -0.545 | -0.351 | -0.259 |
| 0.383000000000098 | -0.544 | -0.35 | -0.259 |
| 0.386000000000098 | -0.543 | -0.35 | -0.259 |
| 0.389000000000098 | -0.542 | -0.35 | -0.259 |
| 0.392000000000098 | -0.541 | -0.349 | -0.258 |
| 0.395000000000098 | -0.54 | -0.349 | -0.258 |
| 0.398000000000098 | -0.54 | -0.349 | -0.258 |
| 0.401000000000098 | -0.539 | -0.348 | -0.258 |
| 0.404000000000098 | -0.538 | -0.348 | -0.258 |
| 0.407000000000098 | -0.537 | -0.347 | -0.257 |
| 0.410000000000098 | -0.536 | -0.347 | -0.257 |
| 0.413000000000098 | -0.535 | -0.347 | -0.257 |
| 0.416000000000098 | -0.534 | -0.346 | -0.257 |
| 0.419000000000098 | -0.533 | -0.346 | -0.257 |
| 0.422000000000098 | -0.533 | -0.346 | -0.256 |
| 0.425000000000098 | -0.532 | -0.345 | -0.256 |
| 0.428000000000098 | -0.531 | -0.345 | -0.256 |
| 0.431000000000098 | -0.53 | -0.345 | -0.256 |
| 0.434000000000098 | -0.529 | -0.344 | -0.256 |
| 0.437000000000098 | -0.528 | -0.344 | -0.255 |
| 0.440000000000098 | -0.527 | -0.343 | -0.255 |
| 0.443000000000098 | -0.527 | -0.343 | -0.255 |
| 0.446000000000098 | -0.526 | -0.343 | -0.255 |
| 0.449000000000098 | -0.525 | -0.342 | -0.255 |
| 0.452000000000098 | -0.524 | -0.342 | -0.254 |
| 0.455000000000098 | -0.523 | -0.342 | -0.254 |
| 0.458000000000098 | -0.522 | -0.341 | -0.254 |
| 0.461000000000098 | -0.521 | -0.341 | -0.254 |
| 0.464000000000098 | -0.521 | -0.341 | -0.254 |
| 0.467000000000098 | -0.52 | -0.34 | -0.253 |
| 0.470000000000098 | -0.519 | -0.34 | -0.253 |
| 0.473000000000098 | -0.518 | -0.34 | -0.253 |
| 0.476000000000098 | -0.517 | -0.339 | -0.253 |
| 0.479000000000098 | -0.516 | -0.339 | -0.253 |
| 0.482000000000098 | -0.516 | -0.339 | -0.252 |
| 0.485000000000098 | -0.515 | -0.338 | -0.252 |
| 0.488000000000098 | -0.514 | -0.338 | -0.252 |
| 0.491000000000098 | -0.513 | -0.338 | -0.252 |
| 0.494000000000098 | -0.512 | -0.337 | -0.252 |
| 0.497000000000098 | -0.512 | -0.337 | -0.252 |
| 0.500000000000098 | -0.511 | -0.336 | -0.251 |